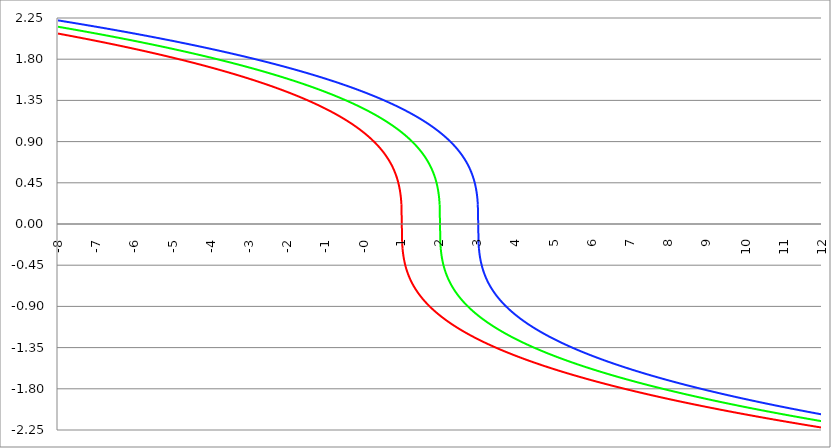
| Category | Series 1 | Series 0 | Series 2 |
|---|---|---|---|
| -8.0 | 2.08 | 2.154 | 2.224 |
| -7.99 | 2.079 | 2.154 | 2.223 |
| -7.98 | 2.079 | 2.153 | 2.223 |
| -7.97 | 2.078 | 2.152 | 2.222 |
| -7.960000000000001 | 2.077 | 2.152 | 2.221 |
| -7.950000000000001 | 2.076 | 2.151 | 2.221 |
| -7.940000000000001 | 2.075 | 2.15 | 2.22 |
| -7.930000000000001 | 2.075 | 2.149 | 2.219 |
| -7.920000000000002 | 2.074 | 2.149 | 2.219 |
| -7.910000000000002 | 2.073 | 2.148 | 2.218 |
| -7.900000000000002 | 2.072 | 2.147 | 2.217 |
| -7.890000000000002 | 2.072 | 2.147 | 2.217 |
| -7.880000000000002 | 2.071 | 2.146 | 2.216 |
| -7.870000000000003 | 2.07 | 2.145 | 2.215 |
| -7.860000000000003 | 2.069 | 2.144 | 2.215 |
| -7.850000000000003 | 2.068 | 2.144 | 2.214 |
| -7.840000000000003 | 2.068 | 2.143 | 2.213 |
| -7.830000000000004 | 2.067 | 2.142 | 2.212 |
| -7.820000000000004 | 2.066 | 2.141 | 2.212 |
| -7.810000000000004 | 2.065 | 2.141 | 2.211 |
| -7.800000000000004 | 2.065 | 2.14 | 2.21 |
| -7.790000000000004 | 2.064 | 2.139 | 2.21 |
| -7.780000000000004 | 2.063 | 2.139 | 2.209 |
| -7.770000000000004 | 2.062 | 2.138 | 2.208 |
| -7.760000000000005 | 2.061 | 2.137 | 2.208 |
| -7.750000000000005 | 2.061 | 2.136 | 2.207 |
| -7.740000000000005 | 2.06 | 2.136 | 2.206 |
| -7.730000000000005 | 2.059 | 2.135 | 2.206 |
| -7.720000000000006 | 2.058 | 2.134 | 2.205 |
| -7.710000000000006 | 2.057 | 2.133 | 2.204 |
| -7.700000000000006 | 2.057 | 2.133 | 2.204 |
| -7.690000000000006 | 2.056 | 2.132 | 2.203 |
| -7.680000000000007 | 2.055 | 2.131 | 2.202 |
| -7.670000000000007 | 2.054 | 2.13 | 2.202 |
| -7.660000000000007 | 2.054 | 2.13 | 2.201 |
| -7.650000000000007 | 2.053 | 2.129 | 2.2 |
| -7.640000000000008 | 2.052 | 2.128 | 2.199 |
| -7.630000000000008 | 2.051 | 2.128 | 2.199 |
| -7.620000000000008 | 2.05 | 2.127 | 2.198 |
| -7.610000000000008 | 2.05 | 2.126 | 2.197 |
| -7.600000000000008 | 2.049 | 2.125 | 2.197 |
| -7.590000000000009 | 2.048 | 2.125 | 2.196 |
| -7.580000000000009 | 2.047 | 2.124 | 2.195 |
| -7.57000000000001 | 2.046 | 2.123 | 2.195 |
| -7.560000000000009 | 2.046 | 2.122 | 2.194 |
| -7.55000000000001 | 2.045 | 2.122 | 2.193 |
| -7.54000000000001 | 2.044 | 2.121 | 2.193 |
| -7.53000000000001 | 2.043 | 2.12 | 2.192 |
| -7.52000000000001 | 2.042 | 2.119 | 2.191 |
| -7.51000000000001 | 2.042 | 2.119 | 2.19 |
| -7.500000000000011 | 2.041 | 2.118 | 2.19 |
| -7.490000000000011 | 2.04 | 2.117 | 2.189 |
| -7.480000000000011 | 2.039 | 2.116 | 2.188 |
| -7.470000000000011 | 2.038 | 2.116 | 2.188 |
| -7.460000000000011 | 2.038 | 2.115 | 2.187 |
| -7.450000000000012 | 2.037 | 2.114 | 2.186 |
| -7.440000000000012 | 2.036 | 2.113 | 2.186 |
| -7.430000000000012 | 2.035 | 2.113 | 2.185 |
| -7.420000000000012 | 2.034 | 2.112 | 2.184 |
| -7.410000000000013 | 2.034 | 2.111 | 2.183 |
| -7.400000000000013 | 2.033 | 2.11 | 2.183 |
| -7.390000000000013 | 2.032 | 2.11 | 2.182 |
| -7.380000000000013 | 2.031 | 2.109 | 2.181 |
| -7.370000000000013 | 2.03 | 2.108 | 2.181 |
| -7.360000000000014 | 2.03 | 2.107 | 2.18 |
| -7.350000000000014 | 2.029 | 2.107 | 2.179 |
| -7.340000000000014 | 2.028 | 2.106 | 2.179 |
| -7.330000000000014 | 2.027 | 2.105 | 2.178 |
| -7.320000000000014 | 2.026 | 2.104 | 2.177 |
| -7.310000000000015 | 2.026 | 2.104 | 2.176 |
| -7.300000000000015 | 2.025 | 2.103 | 2.176 |
| -7.290000000000015 | 2.024 | 2.102 | 2.175 |
| -7.280000000000015 | 2.023 | 2.101 | 2.174 |
| -7.270000000000015 | 2.022 | 2.101 | 2.174 |
| -7.260000000000016 | 2.021 | 2.1 | 2.173 |
| -7.250000000000016 | 2.021 | 2.099 | 2.172 |
| -7.240000000000016 | 2.02 | 2.098 | 2.172 |
| -7.230000000000016 | 2.019 | 2.098 | 2.171 |
| -7.220000000000017 | 2.018 | 2.097 | 2.17 |
| -7.210000000000017 | 2.017 | 2.096 | 2.169 |
| -7.200000000000017 | 2.017 | 2.095 | 2.169 |
| -7.190000000000017 | 2.016 | 2.095 | 2.168 |
| -7.180000000000017 | 2.015 | 2.094 | 2.167 |
| -7.170000000000018 | 2.014 | 2.093 | 2.167 |
| -7.160000000000018 | 2.013 | 2.092 | 2.166 |
| -7.150000000000018 | 2.012 | 2.092 | 2.165 |
| -7.140000000000018 | 2.012 | 2.091 | 2.164 |
| -7.130000000000019 | 2.011 | 2.09 | 2.164 |
| -7.120000000000019 | 2.01 | 2.089 | 2.163 |
| -7.110000000000019 | 2.009 | 2.089 | 2.162 |
| -7.100000000000019 | 2.008 | 2.088 | 2.162 |
| -7.090000000000019 | 2.007 | 2.087 | 2.161 |
| -7.08000000000002 | 2.007 | 2.086 | 2.16 |
| -7.07000000000002 | 2.006 | 2.085 | 2.159 |
| -7.06000000000002 | 2.005 | 2.085 | 2.159 |
| -7.05000000000002 | 2.004 | 2.084 | 2.158 |
| -7.04000000000002 | 2.003 | 2.083 | 2.157 |
| -7.03000000000002 | 2.002 | 2.082 | 2.157 |
| -7.020000000000021 | 2.002 | 2.082 | 2.156 |
| -7.010000000000021 | 2.001 | 2.081 | 2.155 |
| -7.000000000000021 | 2 | 2.08 | 2.154 |
| -6.990000000000021 | 1.999 | 2.079 | 2.154 |
| -6.980000000000021 | 1.998 | 2.079 | 2.153 |
| -6.970000000000021 | 1.997 | 2.078 | 2.152 |
| -6.960000000000022 | 1.997 | 2.077 | 2.152 |
| -6.950000000000022 | 1.996 | 2.076 | 2.151 |
| -6.940000000000022 | 1.995 | 2.075 | 2.15 |
| -6.930000000000022 | 1.994 | 2.075 | 2.149 |
| -6.920000000000023 | 1.993 | 2.074 | 2.149 |
| -6.910000000000023 | 1.992 | 2.073 | 2.148 |
| -6.900000000000023 | 1.992 | 2.072 | 2.147 |
| -6.890000000000024 | 1.991 | 2.072 | 2.147 |
| -6.880000000000024 | 1.99 | 2.071 | 2.146 |
| -6.870000000000024 | 1.989 | 2.07 | 2.145 |
| -6.860000000000024 | 1.988 | 2.069 | 2.144 |
| -6.850000000000024 | 1.987 | 2.068 | 2.144 |
| -6.840000000000024 | 1.987 | 2.068 | 2.143 |
| -6.830000000000024 | 1.986 | 2.067 | 2.142 |
| -6.820000000000025 | 1.985 | 2.066 | 2.141 |
| -6.810000000000025 | 1.984 | 2.065 | 2.141 |
| -6.800000000000025 | 1.983 | 2.065 | 2.14 |
| -6.790000000000025 | 1.982 | 2.064 | 2.139 |
| -6.780000000000025 | 1.981 | 2.063 | 2.139 |
| -6.770000000000026 | 1.981 | 2.062 | 2.138 |
| -6.760000000000026 | 1.98 | 2.061 | 2.137 |
| -6.750000000000026 | 1.979 | 2.061 | 2.136 |
| -6.740000000000026 | 1.978 | 2.06 | 2.136 |
| -6.730000000000026 | 1.977 | 2.059 | 2.135 |
| -6.720000000000027 | 1.976 | 2.058 | 2.134 |
| -6.710000000000027 | 1.976 | 2.057 | 2.133 |
| -6.700000000000027 | 1.975 | 2.057 | 2.133 |
| -6.690000000000028 | 1.974 | 2.056 | 2.132 |
| -6.680000000000028 | 1.973 | 2.055 | 2.131 |
| -6.670000000000028 | 1.972 | 2.054 | 2.13 |
| -6.660000000000028 | 1.971 | 2.054 | 2.13 |
| -6.650000000000029 | 1.97 | 2.053 | 2.129 |
| -6.640000000000029 | 1.97 | 2.052 | 2.128 |
| -6.63000000000003 | 1.969 | 2.051 | 2.128 |
| -6.620000000000029 | 1.968 | 2.05 | 2.127 |
| -6.61000000000003 | 1.967 | 2.05 | 2.126 |
| -6.60000000000003 | 1.966 | 2.049 | 2.125 |
| -6.59000000000003 | 1.965 | 2.048 | 2.125 |
| -6.58000000000003 | 1.964 | 2.047 | 2.124 |
| -6.57000000000003 | 1.964 | 2.046 | 2.123 |
| -6.560000000000031 | 1.963 | 2.046 | 2.122 |
| -6.550000000000031 | 1.962 | 2.045 | 2.122 |
| -6.540000000000031 | 1.961 | 2.044 | 2.121 |
| -6.530000000000031 | 1.96 | 2.043 | 2.12 |
| -6.520000000000032 | 1.959 | 2.042 | 2.119 |
| -6.510000000000032 | 1.958 | 2.042 | 2.119 |
| -6.500000000000032 | 1.957 | 2.041 | 2.118 |
| -6.490000000000032 | 1.957 | 2.04 | 2.117 |
| -6.480000000000032 | 1.956 | 2.039 | 2.116 |
| -6.470000000000032 | 1.955 | 2.038 | 2.116 |
| -6.460000000000033 | 1.954 | 2.038 | 2.115 |
| -6.450000000000033 | 1.953 | 2.037 | 2.114 |
| -6.440000000000033 | 1.952 | 2.036 | 2.113 |
| -6.430000000000033 | 1.951 | 2.035 | 2.113 |
| -6.420000000000034 | 1.95 | 2.034 | 2.112 |
| -6.410000000000034 | 1.95 | 2.034 | 2.111 |
| -6.400000000000034 | 1.949 | 2.033 | 2.11 |
| -6.390000000000034 | 1.948 | 2.032 | 2.11 |
| -6.380000000000034 | 1.947 | 2.031 | 2.109 |
| -6.370000000000034 | 1.946 | 2.03 | 2.108 |
| -6.360000000000035 | 1.945 | 2.03 | 2.107 |
| -6.350000000000035 | 1.944 | 2.029 | 2.107 |
| -6.340000000000035 | 1.943 | 2.028 | 2.106 |
| -6.330000000000035 | 1.943 | 2.027 | 2.105 |
| -6.320000000000036 | 1.942 | 2.026 | 2.104 |
| -6.310000000000036 | 1.941 | 2.026 | 2.104 |
| -6.300000000000036 | 1.94 | 2.025 | 2.103 |
| -6.290000000000036 | 1.939 | 2.024 | 2.102 |
| -6.280000000000036 | 1.938 | 2.023 | 2.101 |
| -6.270000000000036 | 1.937 | 2.022 | 2.101 |
| -6.260000000000037 | 1.936 | 2.021 | 2.1 |
| -6.250000000000037 | 1.935 | 2.021 | 2.099 |
| -6.240000000000037 | 1.935 | 2.02 | 2.098 |
| -6.230000000000037 | 1.934 | 2.019 | 2.098 |
| -6.220000000000038 | 1.933 | 2.018 | 2.097 |
| -6.210000000000038 | 1.932 | 2.017 | 2.096 |
| -6.200000000000038 | 1.931 | 2.017 | 2.095 |
| -6.190000000000039 | 1.93 | 2.016 | 2.095 |
| -6.180000000000039 | 1.929 | 2.015 | 2.094 |
| -6.170000000000039 | 1.928 | 2.014 | 2.093 |
| -6.160000000000039 | 1.927 | 2.013 | 2.092 |
| -6.150000000000039 | 1.926 | 2.012 | 2.092 |
| -6.14000000000004 | 1.926 | 2.012 | 2.091 |
| -6.13000000000004 | 1.925 | 2.011 | 2.09 |
| -6.12000000000004 | 1.924 | 2.01 | 2.089 |
| -6.11000000000004 | 1.923 | 2.009 | 2.089 |
| -6.10000000000004 | 1.922 | 2.008 | 2.088 |
| -6.090000000000041 | 1.921 | 2.007 | 2.087 |
| -6.080000000000041 | 1.92 | 2.007 | 2.086 |
| -6.070000000000041 | 1.919 | 2.006 | 2.085 |
| -6.060000000000041 | 1.918 | 2.005 | 2.085 |
| -6.050000000000042 | 1.917 | 2.004 | 2.084 |
| -6.040000000000042 | 1.917 | 2.003 | 2.083 |
| -6.030000000000042 | 1.916 | 2.002 | 2.082 |
| -6.020000000000042 | 1.915 | 2.002 | 2.082 |
| -6.010000000000042 | 1.914 | 2.001 | 2.081 |
| -6.000000000000043 | 1.913 | 2 | 2.08 |
| -5.990000000000043 | 1.912 | 1.999 | 2.079 |
| -5.980000000000043 | 1.911 | 1.998 | 2.079 |
| -5.970000000000043 | 1.91 | 1.997 | 2.078 |
| -5.960000000000043 | 1.909 | 1.997 | 2.077 |
| -5.950000000000044 | 1.908 | 1.996 | 2.076 |
| -5.940000000000044 | 1.907 | 1.995 | 2.075 |
| -5.930000000000044 | 1.907 | 1.994 | 2.075 |
| -5.920000000000044 | 1.906 | 1.993 | 2.074 |
| -5.910000000000044 | 1.905 | 1.992 | 2.073 |
| -5.900000000000044 | 1.904 | 1.992 | 2.072 |
| -5.890000000000045 | 1.903 | 1.991 | 2.072 |
| -5.880000000000045 | 1.902 | 1.99 | 2.071 |
| -5.870000000000045 | 1.901 | 1.989 | 2.07 |
| -5.860000000000046 | 1.9 | 1.988 | 2.069 |
| -5.850000000000046 | 1.899 | 1.987 | 2.068 |
| -5.840000000000046 | 1.898 | 1.987 | 2.068 |
| -5.830000000000046 | 1.897 | 1.986 | 2.067 |
| -5.820000000000046 | 1.896 | 1.985 | 2.066 |
| -5.810000000000047 | 1.895 | 1.984 | 2.065 |
| -5.800000000000047 | 1.895 | 1.983 | 2.065 |
| -5.790000000000047 | 1.894 | 1.982 | 2.064 |
| -5.780000000000047 | 1.893 | 1.981 | 2.063 |
| -5.770000000000047 | 1.892 | 1.981 | 2.062 |
| -5.760000000000048 | 1.891 | 1.98 | 2.061 |
| -5.750000000000048 | 1.89 | 1.979 | 2.061 |
| -5.740000000000048 | 1.889 | 1.978 | 2.06 |
| -5.730000000000048 | 1.888 | 1.977 | 2.059 |
| -5.720000000000049 | 1.887 | 1.976 | 2.058 |
| -5.710000000000049 | 1.886 | 1.976 | 2.057 |
| -5.700000000000049 | 1.885 | 1.975 | 2.057 |
| -5.690000000000049 | 1.884 | 1.974 | 2.056 |
| -5.680000000000049 | 1.883 | 1.973 | 2.055 |
| -5.67000000000005 | 1.882 | 1.972 | 2.054 |
| -5.66000000000005 | 1.881 | 1.971 | 2.054 |
| -5.65000000000005 | 1.881 | 1.97 | 2.053 |
| -5.64000000000005 | 1.88 | 1.97 | 2.052 |
| -5.63000000000005 | 1.879 | 1.969 | 2.051 |
| -5.620000000000051 | 1.878 | 1.968 | 2.05 |
| -5.610000000000051 | 1.877 | 1.967 | 2.05 |
| -5.600000000000051 | 1.876 | 1.966 | 2.049 |
| -5.590000000000051 | 1.875 | 1.965 | 2.048 |
| -5.580000000000052 | 1.874 | 1.964 | 2.047 |
| -5.570000000000052 | 1.873 | 1.964 | 2.046 |
| -5.560000000000052 | 1.872 | 1.963 | 2.046 |
| -5.550000000000052 | 1.871 | 1.962 | 2.045 |
| -5.540000000000052 | 1.87 | 1.961 | 2.044 |
| -5.530000000000053 | 1.869 | 1.96 | 2.043 |
| -5.520000000000053 | 1.868 | 1.959 | 2.042 |
| -5.510000000000053 | 1.867 | 1.958 | 2.042 |
| -5.500000000000053 | 1.866 | 1.957 | 2.041 |
| -5.490000000000053 | 1.865 | 1.957 | 2.04 |
| -5.480000000000054 | 1.864 | 1.956 | 2.039 |
| -5.470000000000054 | 1.863 | 1.955 | 2.038 |
| -5.460000000000054 | 1.862 | 1.954 | 2.038 |
| -5.450000000000054 | 1.861 | 1.953 | 2.037 |
| -5.440000000000054 | 1.86 | 1.952 | 2.036 |
| -5.430000000000054 | 1.86 | 1.951 | 2.035 |
| -5.420000000000055 | 1.859 | 1.95 | 2.034 |
| -5.410000000000055 | 1.858 | 1.95 | 2.034 |
| -5.400000000000055 | 1.857 | 1.949 | 2.033 |
| -5.390000000000056 | 1.856 | 1.948 | 2.032 |
| -5.380000000000056 | 1.855 | 1.947 | 2.031 |
| -5.370000000000056 | 1.854 | 1.946 | 2.03 |
| -5.360000000000056 | 1.853 | 1.945 | 2.03 |
| -5.350000000000056 | 1.852 | 1.944 | 2.029 |
| -5.340000000000057 | 1.851 | 1.943 | 2.028 |
| -5.330000000000057 | 1.85 | 1.943 | 2.027 |
| -5.320000000000057 | 1.849 | 1.942 | 2.026 |
| -5.310000000000057 | 1.848 | 1.941 | 2.026 |
| -5.300000000000058 | 1.847 | 1.94 | 2.025 |
| -5.290000000000058 | 1.846 | 1.939 | 2.024 |
| -5.280000000000058 | 1.845 | 1.938 | 2.023 |
| -5.270000000000058 | 1.844 | 1.937 | 2.022 |
| -5.260000000000058 | 1.843 | 1.936 | 2.021 |
| -5.250000000000059 | 1.842 | 1.935 | 2.021 |
| -5.240000000000059 | 1.841 | 1.935 | 2.02 |
| -5.23000000000006 | 1.84 | 1.934 | 2.019 |
| -5.220000000000059 | 1.839 | 1.933 | 2.018 |
| -5.210000000000059 | 1.838 | 1.932 | 2.017 |
| -5.20000000000006 | 1.837 | 1.931 | 2.017 |
| -5.19000000000006 | 1.836 | 1.93 | 2.016 |
| -5.18000000000006 | 1.835 | 1.929 | 2.015 |
| -5.17000000000006 | 1.834 | 1.928 | 2.014 |
| -5.160000000000061 | 1.833 | 1.927 | 2.013 |
| -5.150000000000061 | 1.832 | 1.926 | 2.012 |
| -5.140000000000061 | 1.831 | 1.926 | 2.012 |
| -5.130000000000061 | 1.83 | 1.925 | 2.011 |
| -5.120000000000061 | 1.829 | 1.924 | 2.01 |
| -5.110000000000062 | 1.828 | 1.923 | 2.009 |
| -5.100000000000062 | 1.827 | 1.922 | 2.008 |
| -5.090000000000062 | 1.826 | 1.921 | 2.007 |
| -5.080000000000062 | 1.825 | 1.92 | 2.007 |
| -5.070000000000062 | 1.824 | 1.919 | 2.006 |
| -5.060000000000063 | 1.823 | 1.918 | 2.005 |
| -5.050000000000063 | 1.822 | 1.917 | 2.004 |
| -5.040000000000063 | 1.821 | 1.917 | 2.003 |
| -5.030000000000063 | 1.82 | 1.916 | 2.002 |
| -5.020000000000064 | 1.819 | 1.915 | 2.002 |
| -5.010000000000064 | 1.818 | 1.914 | 2.001 |
| -5.000000000000064 | 1.817 | 1.913 | 2 |
| -4.990000000000064 | 1.816 | 1.912 | 1.999 |
| -4.980000000000064 | 1.815 | 1.911 | 1.998 |
| -4.970000000000064 | 1.814 | 1.91 | 1.997 |
| -4.960000000000064 | 1.813 | 1.909 | 1.997 |
| -4.950000000000064 | 1.812 | 1.908 | 1.996 |
| -4.940000000000065 | 1.811 | 1.907 | 1.995 |
| -4.930000000000065 | 1.81 | 1.907 | 1.994 |
| -4.920000000000065 | 1.809 | 1.906 | 1.993 |
| -4.910000000000065 | 1.808 | 1.905 | 1.992 |
| -4.900000000000066 | 1.807 | 1.904 | 1.992 |
| -4.890000000000066 | 1.806 | 1.903 | 1.991 |
| -4.880000000000066 | 1.805 | 1.902 | 1.99 |
| -4.870000000000066 | 1.804 | 1.901 | 1.989 |
| -4.860000000000067 | 1.803 | 1.9 | 1.988 |
| -4.850000000000067 | 1.802 | 1.899 | 1.987 |
| -4.840000000000067 | 1.801 | 1.898 | 1.987 |
| -4.830000000000067 | 1.8 | 1.897 | 1.986 |
| -4.820000000000068 | 1.799 | 1.896 | 1.985 |
| -4.810000000000068 | 1.798 | 1.895 | 1.984 |
| -4.800000000000068 | 1.797 | 1.895 | 1.983 |
| -4.790000000000068 | 1.796 | 1.894 | 1.982 |
| -4.780000000000068 | 1.795 | 1.893 | 1.981 |
| -4.770000000000068 | 1.794 | 1.892 | 1.981 |
| -4.760000000000069 | 1.793 | 1.891 | 1.98 |
| -4.75000000000007 | 1.792 | 1.89 | 1.979 |
| -4.74000000000007 | 1.79 | 1.889 | 1.978 |
| -4.73000000000007 | 1.789 | 1.888 | 1.977 |
| -4.72000000000007 | 1.788 | 1.887 | 1.976 |
| -4.71000000000007 | 1.787 | 1.886 | 1.976 |
| -4.70000000000007 | 1.786 | 1.885 | 1.975 |
| -4.69000000000007 | 1.785 | 1.884 | 1.974 |
| -4.680000000000071 | 1.784 | 1.883 | 1.973 |
| -4.670000000000071 | 1.783 | 1.882 | 1.972 |
| -4.660000000000071 | 1.782 | 1.881 | 1.971 |
| -4.650000000000071 | 1.781 | 1.881 | 1.97 |
| -4.640000000000072 | 1.78 | 1.88 | 1.97 |
| -4.630000000000072 | 1.779 | 1.879 | 1.969 |
| -4.620000000000072 | 1.778 | 1.878 | 1.968 |
| -4.610000000000072 | 1.777 | 1.877 | 1.967 |
| -4.600000000000072 | 1.776 | 1.876 | 1.966 |
| -4.590000000000073 | 1.775 | 1.875 | 1.965 |
| -4.580000000000073 | 1.774 | 1.874 | 1.964 |
| -4.570000000000073 | 1.773 | 1.873 | 1.964 |
| -4.560000000000073 | 1.772 | 1.872 | 1.963 |
| -4.550000000000074 | 1.771 | 1.871 | 1.962 |
| -4.540000000000074 | 1.769 | 1.87 | 1.961 |
| -4.530000000000074 | 1.768 | 1.869 | 1.96 |
| -4.520000000000074 | 1.767 | 1.868 | 1.959 |
| -4.510000000000074 | 1.766 | 1.867 | 1.958 |
| -4.500000000000074 | 1.765 | 1.866 | 1.957 |
| -4.490000000000074 | 1.764 | 1.865 | 1.957 |
| -4.480000000000074 | 1.763 | 1.864 | 1.956 |
| -4.470000000000075 | 1.762 | 1.863 | 1.955 |
| -4.460000000000075 | 1.761 | 1.862 | 1.954 |
| -4.450000000000075 | 1.76 | 1.861 | 1.953 |
| -4.440000000000075 | 1.759 | 1.86 | 1.952 |
| -4.430000000000076 | 1.758 | 1.86 | 1.951 |
| -4.420000000000076 | 1.757 | 1.859 | 1.95 |
| -4.410000000000076 | 1.755 | 1.858 | 1.95 |
| -4.400000000000076 | 1.754 | 1.857 | 1.949 |
| -4.390000000000077 | 1.753 | 1.856 | 1.948 |
| -4.380000000000077 | 1.752 | 1.855 | 1.947 |
| -4.370000000000077 | 1.751 | 1.854 | 1.946 |
| -4.360000000000078 | 1.75 | 1.853 | 1.945 |
| -4.350000000000078 | 1.749 | 1.852 | 1.944 |
| -4.340000000000078 | 1.748 | 1.851 | 1.943 |
| -4.330000000000078 | 1.747 | 1.85 | 1.943 |
| -4.320000000000078 | 1.746 | 1.849 | 1.942 |
| -4.310000000000079 | 1.745 | 1.848 | 1.941 |
| -4.300000000000079 | 1.744 | 1.847 | 1.94 |
| -4.29000000000008 | 1.742 | 1.846 | 1.939 |
| -4.28000000000008 | 1.741 | 1.845 | 1.938 |
| -4.27000000000008 | 1.74 | 1.844 | 1.937 |
| -4.26000000000008 | 1.739 | 1.843 | 1.936 |
| -4.25000000000008 | 1.738 | 1.842 | 1.935 |
| -4.24000000000008 | 1.737 | 1.841 | 1.935 |
| -4.23000000000008 | 1.736 | 1.84 | 1.934 |
| -4.220000000000081 | 1.735 | 1.839 | 1.933 |
| -4.210000000000081 | 1.734 | 1.838 | 1.932 |
| -4.200000000000081 | 1.732 | 1.837 | 1.931 |
| -4.190000000000081 | 1.731 | 1.836 | 1.93 |
| -4.180000000000081 | 1.73 | 1.835 | 1.929 |
| -4.170000000000082 | 1.729 | 1.834 | 1.928 |
| -4.160000000000082 | 1.728 | 1.833 | 1.927 |
| -4.150000000000082 | 1.727 | 1.832 | 1.926 |
| -4.140000000000082 | 1.726 | 1.831 | 1.926 |
| -4.130000000000082 | 1.725 | 1.83 | 1.925 |
| -4.120000000000083 | 1.724 | 1.829 | 1.924 |
| -4.110000000000083 | 1.722 | 1.828 | 1.923 |
| -4.100000000000083 | 1.721 | 1.827 | 1.922 |
| -4.090000000000083 | 1.72 | 1.826 | 1.921 |
| -4.080000000000084 | 1.719 | 1.825 | 1.92 |
| -4.070000000000084 | 1.718 | 1.824 | 1.919 |
| -4.060000000000084 | 1.717 | 1.823 | 1.918 |
| -4.050000000000084 | 1.716 | 1.822 | 1.917 |
| -4.040000000000084 | 1.715 | 1.821 | 1.917 |
| -4.030000000000084 | 1.713 | 1.82 | 1.916 |
| -4.020000000000085 | 1.712 | 1.819 | 1.915 |
| -4.010000000000085 | 1.711 | 1.818 | 1.914 |
| -4.000000000000085 | 1.71 | 1.817 | 1.913 |
| -3.990000000000085 | 1.709 | 1.816 | 1.912 |
| -3.980000000000086 | 1.708 | 1.815 | 1.911 |
| -3.970000000000086 | 1.707 | 1.814 | 1.91 |
| -3.960000000000086 | 1.705 | 1.813 | 1.909 |
| -3.950000000000086 | 1.704 | 1.812 | 1.908 |
| -3.940000000000087 | 1.703 | 1.811 | 1.907 |
| -3.930000000000087 | 1.702 | 1.81 | 1.907 |
| -3.920000000000087 | 1.701 | 1.809 | 1.906 |
| -3.910000000000087 | 1.7 | 1.808 | 1.905 |
| -3.900000000000087 | 1.698 | 1.807 | 1.904 |
| -3.890000000000088 | 1.697 | 1.806 | 1.903 |
| -3.880000000000088 | 1.696 | 1.805 | 1.902 |
| -3.870000000000088 | 1.695 | 1.804 | 1.901 |
| -3.860000000000088 | 1.694 | 1.803 | 1.9 |
| -3.850000000000088 | 1.693 | 1.802 | 1.899 |
| -3.840000000000089 | 1.692 | 1.801 | 1.898 |
| -3.830000000000089 | 1.69 | 1.8 | 1.897 |
| -3.820000000000089 | 1.689 | 1.799 | 1.896 |
| -3.810000000000089 | 1.688 | 1.798 | 1.895 |
| -3.800000000000089 | 1.687 | 1.797 | 1.895 |
| -3.79000000000009 | 1.686 | 1.796 | 1.894 |
| -3.78000000000009 | 1.685 | 1.795 | 1.893 |
| -3.77000000000009 | 1.683 | 1.794 | 1.892 |
| -3.76000000000009 | 1.682 | 1.793 | 1.891 |
| -3.750000000000091 | 1.681 | 1.792 | 1.89 |
| -3.740000000000091 | 1.68 | 1.79 | 1.889 |
| -3.730000000000091 | 1.679 | 1.789 | 1.888 |
| -3.720000000000091 | 1.677 | 1.788 | 1.887 |
| -3.710000000000091 | 1.676 | 1.787 | 1.886 |
| -3.700000000000092 | 1.675 | 1.786 | 1.885 |
| -3.690000000000092 | 1.674 | 1.785 | 1.884 |
| -3.680000000000092 | 1.673 | 1.784 | 1.883 |
| -3.670000000000092 | 1.671 | 1.783 | 1.882 |
| -3.660000000000092 | 1.67 | 1.782 | 1.881 |
| -3.650000000000093 | 1.669 | 1.781 | 1.881 |
| -3.640000000000093 | 1.668 | 1.78 | 1.88 |
| -3.630000000000093 | 1.667 | 1.779 | 1.879 |
| -3.620000000000093 | 1.666 | 1.778 | 1.878 |
| -3.610000000000093 | 1.664 | 1.777 | 1.877 |
| -3.600000000000094 | 1.663 | 1.776 | 1.876 |
| -3.590000000000094 | 1.662 | 1.775 | 1.875 |
| -3.580000000000094 | 1.661 | 1.774 | 1.874 |
| -3.570000000000094 | 1.659 | 1.773 | 1.873 |
| -3.560000000000095 | 1.658 | 1.772 | 1.872 |
| -3.550000000000095 | 1.657 | 1.771 | 1.871 |
| -3.540000000000095 | 1.656 | 1.769 | 1.87 |
| -3.530000000000095 | 1.655 | 1.768 | 1.869 |
| -3.520000000000095 | 1.653 | 1.767 | 1.868 |
| -3.510000000000096 | 1.652 | 1.766 | 1.867 |
| -3.500000000000096 | 1.651 | 1.765 | 1.866 |
| -3.490000000000096 | 1.65 | 1.764 | 1.865 |
| -3.480000000000096 | 1.649 | 1.763 | 1.864 |
| -3.470000000000097 | 1.647 | 1.762 | 1.863 |
| -3.460000000000097 | 1.646 | 1.761 | 1.862 |
| -3.450000000000097 | 1.645 | 1.76 | 1.861 |
| -3.440000000000097 | 1.644 | 1.759 | 1.86 |
| -3.430000000000097 | 1.642 | 1.758 | 1.86 |
| -3.420000000000098 | 1.641 | 1.757 | 1.859 |
| -3.410000000000098 | 1.64 | 1.755 | 1.858 |
| -3.400000000000098 | 1.639 | 1.754 | 1.857 |
| -3.390000000000098 | 1.637 | 1.753 | 1.856 |
| -3.380000000000098 | 1.636 | 1.752 | 1.855 |
| -3.370000000000099 | 1.635 | 1.751 | 1.854 |
| -3.360000000000099 | 1.634 | 1.75 | 1.853 |
| -3.350000000000099 | 1.632 | 1.749 | 1.852 |
| -3.340000000000099 | 1.631 | 1.748 | 1.851 |
| -3.330000000000099 | 1.63 | 1.747 | 1.85 |
| -3.3200000000001 | 1.629 | 1.746 | 1.849 |
| -3.3100000000001 | 1.627 | 1.745 | 1.848 |
| -3.3000000000001 | 1.626 | 1.744 | 1.847 |
| -3.2900000000001 | 1.625 | 1.742 | 1.846 |
| -3.280000000000101 | 1.624 | 1.741 | 1.845 |
| -3.270000000000101 | 1.622 | 1.74 | 1.844 |
| -3.260000000000101 | 1.621 | 1.739 | 1.843 |
| -3.250000000000101 | 1.62 | 1.738 | 1.842 |
| -3.240000000000101 | 1.619 | 1.737 | 1.841 |
| -3.230000000000102 | 1.617 | 1.736 | 1.84 |
| -3.220000000000102 | 1.616 | 1.735 | 1.839 |
| -3.210000000000102 | 1.615 | 1.734 | 1.838 |
| -3.200000000000102 | 1.613 | 1.732 | 1.837 |
| -3.190000000000103 | 1.612 | 1.731 | 1.836 |
| -3.180000000000103 | 1.611 | 1.73 | 1.835 |
| -3.170000000000103 | 1.61 | 1.729 | 1.834 |
| -3.160000000000103 | 1.608 | 1.728 | 1.833 |
| -3.150000000000103 | 1.607 | 1.727 | 1.832 |
| -3.140000000000104 | 1.606 | 1.726 | 1.831 |
| -3.130000000000104 | 1.604 | 1.725 | 1.83 |
| -3.120000000000104 | 1.603 | 1.724 | 1.829 |
| -3.110000000000104 | 1.602 | 1.722 | 1.828 |
| -3.100000000000104 | 1.601 | 1.721 | 1.827 |
| -3.090000000000105 | 1.599 | 1.72 | 1.826 |
| -3.080000000000105 | 1.598 | 1.719 | 1.825 |
| -3.070000000000105 | 1.597 | 1.718 | 1.824 |
| -3.060000000000105 | 1.595 | 1.717 | 1.823 |
| -3.050000000000106 | 1.594 | 1.716 | 1.822 |
| -3.040000000000106 | 1.593 | 1.715 | 1.821 |
| -3.030000000000106 | 1.591 | 1.713 | 1.82 |
| -3.020000000000106 | 1.59 | 1.712 | 1.819 |
| -3.010000000000106 | 1.589 | 1.711 | 1.818 |
| -3.000000000000107 | 1.587 | 1.71 | 1.817 |
| -2.990000000000107 | 1.586 | 1.709 | 1.816 |
| -2.980000000000107 | 1.585 | 1.708 | 1.815 |
| -2.970000000000107 | 1.583 | 1.707 | 1.814 |
| -2.960000000000107 | 1.582 | 1.705 | 1.813 |
| -2.950000000000108 | 1.581 | 1.704 | 1.812 |
| -2.940000000000108 | 1.579 | 1.703 | 1.811 |
| -2.930000000000108 | 1.578 | 1.702 | 1.81 |
| -2.920000000000108 | 1.577 | 1.701 | 1.809 |
| -2.910000000000108 | 1.575 | 1.7 | 1.808 |
| -2.900000000000109 | 1.574 | 1.698 | 1.807 |
| -2.890000000000109 | 1.573 | 1.697 | 1.806 |
| -2.880000000000109 | 1.571 | 1.696 | 1.805 |
| -2.870000000000109 | 1.57 | 1.695 | 1.804 |
| -2.86000000000011 | 1.569 | 1.694 | 1.803 |
| -2.85000000000011 | 1.567 | 1.693 | 1.802 |
| -2.84000000000011 | 1.566 | 1.692 | 1.801 |
| -2.83000000000011 | 1.565 | 1.69 | 1.8 |
| -2.82000000000011 | 1.563 | 1.689 | 1.799 |
| -2.810000000000111 | 1.562 | 1.688 | 1.798 |
| -2.800000000000111 | 1.56 | 1.687 | 1.797 |
| -2.790000000000111 | 1.559 | 1.686 | 1.796 |
| -2.780000000000111 | 1.558 | 1.685 | 1.795 |
| -2.770000000000111 | 1.556 | 1.683 | 1.794 |
| -2.760000000000112 | 1.555 | 1.682 | 1.793 |
| -2.750000000000112 | 1.554 | 1.681 | 1.792 |
| -2.740000000000112 | 1.552 | 1.68 | 1.79 |
| -2.730000000000112 | 1.551 | 1.679 | 1.789 |
| -2.720000000000112 | 1.549 | 1.677 | 1.788 |
| -2.710000000000113 | 1.548 | 1.676 | 1.787 |
| -2.700000000000113 | 1.547 | 1.675 | 1.786 |
| -2.690000000000113 | 1.545 | 1.674 | 1.785 |
| -2.680000000000113 | 1.544 | 1.673 | 1.784 |
| -2.670000000000114 | 1.542 | 1.671 | 1.783 |
| -2.660000000000114 | 1.541 | 1.67 | 1.782 |
| -2.650000000000114 | 1.54 | 1.669 | 1.781 |
| -2.640000000000114 | 1.538 | 1.668 | 1.78 |
| -2.630000000000114 | 1.537 | 1.667 | 1.779 |
| -2.620000000000115 | 1.535 | 1.666 | 1.778 |
| -2.610000000000115 | 1.534 | 1.664 | 1.777 |
| -2.600000000000115 | 1.533 | 1.663 | 1.776 |
| -2.590000000000115 | 1.531 | 1.662 | 1.775 |
| -2.580000000000116 | 1.53 | 1.661 | 1.774 |
| -2.570000000000116 | 1.528 | 1.659 | 1.773 |
| -2.560000000000116 | 1.527 | 1.658 | 1.772 |
| -2.550000000000116 | 1.525 | 1.657 | 1.771 |
| -2.540000000000116 | 1.524 | 1.656 | 1.769 |
| -2.530000000000117 | 1.523 | 1.655 | 1.768 |
| -2.520000000000117 | 1.521 | 1.653 | 1.767 |
| -2.510000000000117 | 1.52 | 1.652 | 1.766 |
| -2.500000000000117 | 1.518 | 1.651 | 1.765 |
| -2.490000000000117 | 1.517 | 1.65 | 1.764 |
| -2.480000000000118 | 1.515 | 1.649 | 1.763 |
| -2.470000000000118 | 1.514 | 1.647 | 1.762 |
| -2.460000000000118 | 1.512 | 1.646 | 1.761 |
| -2.450000000000118 | 1.511 | 1.645 | 1.76 |
| -2.440000000000118 | 1.51 | 1.644 | 1.759 |
| -2.430000000000119 | 1.508 | 1.642 | 1.758 |
| -2.420000000000119 | 1.507 | 1.641 | 1.757 |
| -2.410000000000119 | 1.505 | 1.64 | 1.755 |
| -2.400000000000119 | 1.504 | 1.639 | 1.754 |
| -2.39000000000012 | 1.502 | 1.637 | 1.753 |
| -2.38000000000012 | 1.501 | 1.636 | 1.752 |
| -2.37000000000012 | 1.499 | 1.635 | 1.751 |
| -2.36000000000012 | 1.498 | 1.634 | 1.75 |
| -2.35000000000012 | 1.496 | 1.632 | 1.749 |
| -2.340000000000121 | 1.495 | 1.631 | 1.748 |
| -2.330000000000121 | 1.493 | 1.63 | 1.747 |
| -2.320000000000121 | 1.492 | 1.629 | 1.746 |
| -2.310000000000121 | 1.49 | 1.627 | 1.745 |
| -2.300000000000121 | 1.489 | 1.626 | 1.744 |
| -2.290000000000122 | 1.487 | 1.625 | 1.742 |
| -2.280000000000122 | 1.486 | 1.624 | 1.741 |
| -2.270000000000122 | 1.484 | 1.622 | 1.74 |
| -2.260000000000122 | 1.483 | 1.621 | 1.739 |
| -2.250000000000123 | 1.481 | 1.62 | 1.738 |
| -2.240000000000123 | 1.48 | 1.619 | 1.737 |
| -2.230000000000123 | 1.478 | 1.617 | 1.736 |
| -2.220000000000123 | 1.477 | 1.616 | 1.735 |
| -2.210000000000123 | 1.475 | 1.615 | 1.734 |
| -2.200000000000124 | 1.474 | 1.613 | 1.732 |
| -2.190000000000124 | 1.472 | 1.612 | 1.731 |
| -2.180000000000124 | 1.471 | 1.611 | 1.73 |
| -2.170000000000124 | 1.469 | 1.61 | 1.729 |
| -2.160000000000124 | 1.467 | 1.608 | 1.728 |
| -2.150000000000125 | 1.466 | 1.607 | 1.727 |
| -2.140000000000125 | 1.464 | 1.606 | 1.726 |
| -2.130000000000125 | 1.463 | 1.604 | 1.725 |
| -2.120000000000125 | 1.461 | 1.603 | 1.724 |
| -2.110000000000126 | 1.46 | 1.602 | 1.722 |
| -2.100000000000126 | 1.458 | 1.601 | 1.721 |
| -2.090000000000126 | 1.457 | 1.599 | 1.72 |
| -2.080000000000126 | 1.455 | 1.598 | 1.719 |
| -2.070000000000126 | 1.453 | 1.597 | 1.718 |
| -2.060000000000127 | 1.452 | 1.595 | 1.717 |
| -2.050000000000127 | 1.45 | 1.594 | 1.716 |
| -2.040000000000127 | 1.449 | 1.593 | 1.715 |
| -2.030000000000127 | 1.447 | 1.591 | 1.713 |
| -2.020000000000127 | 1.445 | 1.59 | 1.712 |
| -2.010000000000128 | 1.444 | 1.589 | 1.711 |
| -2.000000000000128 | 1.442 | 1.587 | 1.71 |
| -1.990000000000128 | 1.441 | 1.586 | 1.709 |
| -1.980000000000128 | 1.439 | 1.585 | 1.708 |
| -1.970000000000128 | 1.437 | 1.583 | 1.707 |
| -1.960000000000128 | 1.436 | 1.582 | 1.705 |
| -1.950000000000128 | 1.434 | 1.581 | 1.704 |
| -1.940000000000128 | 1.433 | 1.579 | 1.703 |
| -1.930000000000128 | 1.431 | 1.578 | 1.702 |
| -1.920000000000128 | 1.429 | 1.577 | 1.701 |
| -1.910000000000128 | 1.428 | 1.575 | 1.7 |
| -1.900000000000128 | 1.426 | 1.574 | 1.698 |
| -1.890000000000128 | 1.424 | 1.573 | 1.697 |
| -1.880000000000128 | 1.423 | 1.571 | 1.696 |
| -1.870000000000128 | 1.421 | 1.57 | 1.695 |
| -1.860000000000128 | 1.419 | 1.569 | 1.694 |
| -1.850000000000128 | 1.418 | 1.567 | 1.693 |
| -1.840000000000128 | 1.416 | 1.566 | 1.692 |
| -1.830000000000128 | 1.414 | 1.565 | 1.69 |
| -1.820000000000128 | 1.413 | 1.563 | 1.689 |
| -1.810000000000128 | 1.411 | 1.562 | 1.688 |
| -1.800000000000128 | 1.409 | 1.56 | 1.687 |
| -1.790000000000128 | 1.408 | 1.559 | 1.686 |
| -1.780000000000128 | 1.406 | 1.558 | 1.685 |
| -1.770000000000128 | 1.404 | 1.556 | 1.683 |
| -1.760000000000128 | 1.403 | 1.555 | 1.682 |
| -1.750000000000128 | 1.401 | 1.554 | 1.681 |
| -1.740000000000128 | 1.399 | 1.552 | 1.68 |
| -1.730000000000128 | 1.398 | 1.551 | 1.679 |
| -1.720000000000128 | 1.396 | 1.549 | 1.677 |
| -1.710000000000128 | 1.394 | 1.548 | 1.676 |
| -1.700000000000128 | 1.392 | 1.547 | 1.675 |
| -1.690000000000128 | 1.391 | 1.545 | 1.674 |
| -1.680000000000128 | 1.389 | 1.544 | 1.673 |
| -1.670000000000128 | 1.387 | 1.542 | 1.671 |
| -1.660000000000127 | 1.386 | 1.541 | 1.67 |
| -1.650000000000127 | 1.384 | 1.54 | 1.669 |
| -1.640000000000127 | 1.382 | 1.538 | 1.668 |
| -1.630000000000127 | 1.38 | 1.537 | 1.667 |
| -1.620000000000127 | 1.379 | 1.535 | 1.666 |
| -1.610000000000127 | 1.377 | 1.534 | 1.664 |
| -1.600000000000127 | 1.375 | 1.533 | 1.663 |
| -1.590000000000128 | 1.373 | 1.531 | 1.662 |
| -1.580000000000128 | 1.372 | 1.53 | 1.661 |
| -1.570000000000128 | 1.37 | 1.528 | 1.659 |
| -1.560000000000127 | 1.368 | 1.527 | 1.658 |
| -1.550000000000127 | 1.366 | 1.525 | 1.657 |
| -1.540000000000127 | 1.364 | 1.524 | 1.656 |
| -1.530000000000127 | 1.363 | 1.523 | 1.655 |
| -1.520000000000127 | 1.361 | 1.521 | 1.653 |
| -1.510000000000127 | 1.359 | 1.52 | 1.652 |
| -1.500000000000127 | 1.357 | 1.518 | 1.651 |
| -1.490000000000127 | 1.355 | 1.517 | 1.65 |
| -1.480000000000127 | 1.354 | 1.515 | 1.649 |
| -1.470000000000127 | 1.352 | 1.514 | 1.647 |
| -1.460000000000127 | 1.35 | 1.512 | 1.646 |
| -1.450000000000127 | 1.348 | 1.511 | 1.645 |
| -1.440000000000127 | 1.346 | 1.51 | 1.644 |
| -1.430000000000127 | 1.344 | 1.508 | 1.642 |
| -1.420000000000127 | 1.343 | 1.507 | 1.641 |
| -1.410000000000127 | 1.341 | 1.505 | 1.64 |
| -1.400000000000127 | 1.339 | 1.504 | 1.639 |
| -1.390000000000127 | 1.337 | 1.502 | 1.637 |
| -1.380000000000127 | 1.335 | 1.501 | 1.636 |
| -1.370000000000127 | 1.333 | 1.499 | 1.635 |
| -1.360000000000127 | 1.331 | 1.498 | 1.634 |
| -1.350000000000127 | 1.33 | 1.496 | 1.632 |
| -1.340000000000127 | 1.328 | 1.495 | 1.631 |
| -1.330000000000127 | 1.326 | 1.493 | 1.63 |
| -1.320000000000127 | 1.324 | 1.492 | 1.629 |
| -1.310000000000127 | 1.322 | 1.49 | 1.627 |
| -1.300000000000127 | 1.32 | 1.489 | 1.626 |
| -1.290000000000127 | 1.318 | 1.487 | 1.625 |
| -1.280000000000127 | 1.316 | 1.486 | 1.624 |
| -1.270000000000127 | 1.314 | 1.484 | 1.622 |
| -1.260000000000127 | 1.312 | 1.483 | 1.621 |
| -1.250000000000127 | 1.31 | 1.481 | 1.62 |
| -1.240000000000127 | 1.308 | 1.48 | 1.619 |
| -1.230000000000127 | 1.306 | 1.478 | 1.617 |
| -1.220000000000127 | 1.305 | 1.477 | 1.616 |
| -1.210000000000127 | 1.303 | 1.475 | 1.615 |
| -1.200000000000127 | 1.301 | 1.474 | 1.613 |
| -1.190000000000127 | 1.299 | 1.472 | 1.612 |
| -1.180000000000127 | 1.297 | 1.471 | 1.611 |
| -1.170000000000127 | 1.295 | 1.469 | 1.61 |
| -1.160000000000127 | 1.293 | 1.467 | 1.608 |
| -1.150000000000127 | 1.291 | 1.466 | 1.607 |
| -1.140000000000127 | 1.289 | 1.464 | 1.606 |
| -1.130000000000127 | 1.287 | 1.463 | 1.604 |
| -1.120000000000127 | 1.285 | 1.461 | 1.603 |
| -1.110000000000127 | 1.283 | 1.46 | 1.602 |
| -1.100000000000127 | 1.281 | 1.458 | 1.601 |
| -1.090000000000127 | 1.279 | 1.457 | 1.599 |
| -1.080000000000127 | 1.277 | 1.455 | 1.598 |
| -1.070000000000127 | 1.274 | 1.453 | 1.597 |
| -1.060000000000127 | 1.272 | 1.452 | 1.595 |
| -1.050000000000127 | 1.27 | 1.45 | 1.594 |
| -1.040000000000127 | 1.268 | 1.449 | 1.593 |
| -1.030000000000127 | 1.266 | 1.447 | 1.591 |
| -1.020000000000127 | 1.264 | 1.445 | 1.59 |
| -1.010000000000127 | 1.262 | 1.444 | 1.589 |
| -1.000000000000127 | 1.26 | 1.442 | 1.587 |
| -0.990000000000127 | 1.258 | 1.441 | 1.586 |
| -0.980000000000127 | 1.256 | 1.439 | 1.585 |
| -0.970000000000127 | 1.254 | 1.437 | 1.583 |
| -0.960000000000127 | 1.251 | 1.436 | 1.582 |
| -0.950000000000127 | 1.249 | 1.434 | 1.581 |
| -0.940000000000127 | 1.247 | 1.433 | 1.579 |
| -0.930000000000127 | 1.245 | 1.431 | 1.578 |
| -0.920000000000127 | 1.243 | 1.429 | 1.577 |
| -0.910000000000127 | 1.241 | 1.428 | 1.575 |
| -0.900000000000127 | 1.239 | 1.426 | 1.574 |
| -0.890000000000127 | 1.236 | 1.424 | 1.573 |
| -0.880000000000127 | 1.234 | 1.423 | 1.571 |
| -0.870000000000127 | 1.232 | 1.421 | 1.57 |
| -0.860000000000127 | 1.23 | 1.419 | 1.569 |
| -0.850000000000127 | 1.228 | 1.418 | 1.567 |
| -0.840000000000127 | 1.225 | 1.416 | 1.566 |
| -0.830000000000127 | 1.223 | 1.414 | 1.565 |
| -0.820000000000127 | 1.221 | 1.413 | 1.563 |
| -0.810000000000127 | 1.219 | 1.411 | 1.562 |
| -0.800000000000127 | 1.216 | 1.409 | 1.56 |
| -0.790000000000127 | 1.214 | 1.408 | 1.559 |
| -0.780000000000127 | 1.212 | 1.406 | 1.558 |
| -0.770000000000127 | 1.21 | 1.404 | 1.556 |
| -0.760000000000127 | 1.207 | 1.403 | 1.555 |
| -0.750000000000127 | 1.205 | 1.401 | 1.554 |
| -0.740000000000127 | 1.203 | 1.399 | 1.552 |
| -0.730000000000127 | 1.2 | 1.398 | 1.551 |
| -0.720000000000127 | 1.198 | 1.396 | 1.549 |
| -0.710000000000127 | 1.196 | 1.394 | 1.548 |
| -0.700000000000127 | 1.193 | 1.392 | 1.547 |
| -0.690000000000127 | 1.191 | 1.391 | 1.545 |
| -0.680000000000127 | 1.189 | 1.389 | 1.544 |
| -0.670000000000127 | 1.186 | 1.387 | 1.542 |
| -0.660000000000127 | 1.184 | 1.386 | 1.541 |
| -0.650000000000127 | 1.182 | 1.384 | 1.54 |
| -0.640000000000127 | 1.179 | 1.382 | 1.538 |
| -0.630000000000127 | 1.177 | 1.38 | 1.537 |
| -0.620000000000127 | 1.174 | 1.379 | 1.535 |
| -0.610000000000127 | 1.172 | 1.377 | 1.534 |
| -0.600000000000127 | 1.17 | 1.375 | 1.533 |
| -0.590000000000127 | 1.167 | 1.373 | 1.531 |
| -0.580000000000127 | 1.165 | 1.372 | 1.53 |
| -0.570000000000127 | 1.162 | 1.37 | 1.528 |
| -0.560000000000127 | 1.16 | 1.368 | 1.527 |
| -0.550000000000127 | 1.157 | 1.366 | 1.525 |
| -0.540000000000127 | 1.155 | 1.364 | 1.524 |
| -0.530000000000127 | 1.152 | 1.363 | 1.523 |
| -0.520000000000127 | 1.15 | 1.361 | 1.521 |
| -0.510000000000127 | 1.147 | 1.359 | 1.52 |
| -0.500000000000127 | 1.145 | 1.357 | 1.518 |
| -0.490000000000127 | 1.142 | 1.355 | 1.517 |
| -0.480000000000127 | 1.14 | 1.354 | 1.515 |
| -0.470000000000127 | 1.137 | 1.352 | 1.514 |
| -0.460000000000126 | 1.134 | 1.35 | 1.512 |
| -0.450000000000126 | 1.132 | 1.348 | 1.511 |
| -0.440000000000126 | 1.129 | 1.346 | 1.51 |
| -0.430000000000126 | 1.127 | 1.344 | 1.508 |
| -0.420000000000126 | 1.124 | 1.343 | 1.507 |
| -0.410000000000126 | 1.121 | 1.341 | 1.505 |
| -0.400000000000126 | 1.119 | 1.339 | 1.504 |
| -0.390000000000126 | 1.116 | 1.337 | 1.502 |
| -0.380000000000126 | 1.113 | 1.335 | 1.501 |
| -0.370000000000126 | 1.111 | 1.333 | 1.499 |
| -0.360000000000126 | 1.108 | 1.331 | 1.498 |
| -0.350000000000126 | 1.105 | 1.33 | 1.496 |
| -0.340000000000126 | 1.102 | 1.328 | 1.495 |
| -0.330000000000126 | 1.1 | 1.326 | 1.493 |
| -0.320000000000126 | 1.097 | 1.324 | 1.492 |
| -0.310000000000126 | 1.094 | 1.322 | 1.49 |
| -0.300000000000126 | 1.091 | 1.32 | 1.489 |
| -0.290000000000126 | 1.089 | 1.318 | 1.487 |
| -0.280000000000126 | 1.086 | 1.316 | 1.486 |
| -0.270000000000126 | 1.083 | 1.314 | 1.484 |
| -0.260000000000126 | 1.08 | 1.312 | 1.483 |
| -0.250000000000126 | 1.077 | 1.31 | 1.481 |
| -0.240000000000126 | 1.074 | 1.308 | 1.48 |
| -0.230000000000126 | 1.071 | 1.306 | 1.478 |
| -0.220000000000126 | 1.069 | 1.305 | 1.477 |
| -0.210000000000126 | 1.066 | 1.303 | 1.475 |
| -0.200000000000126 | 1.063 | 1.301 | 1.474 |
| -0.190000000000126 | 1.06 | 1.299 | 1.472 |
| -0.180000000000126 | 1.057 | 1.297 | 1.471 |
| -0.170000000000126 | 1.054 | 1.295 | 1.469 |
| -0.160000000000126 | 1.051 | 1.293 | 1.467 |
| -0.150000000000126 | 1.048 | 1.291 | 1.466 |
| -0.140000000000126 | 1.045 | 1.289 | 1.464 |
| -0.130000000000126 | 1.042 | 1.287 | 1.463 |
| -0.120000000000126 | 1.038 | 1.285 | 1.461 |
| -0.110000000000126 | 1.035 | 1.283 | 1.46 |
| -0.100000000000126 | 1.032 | 1.281 | 1.458 |
| -0.0900000000001262 | 1.029 | 1.279 | 1.457 |
| -0.0800000000001262 | 1.026 | 1.277 | 1.455 |
| -0.0700000000001263 | 1.023 | 1.274 | 1.453 |
| -0.0600000000001263 | 1.02 | 1.272 | 1.452 |
| -0.0500000000001263 | 1.016 | 1.27 | 1.45 |
| -0.0400000000001263 | 1.013 | 1.268 | 1.449 |
| -0.0300000000001263 | 1.01 | 1.266 | 1.447 |
| -0.0200000000001263 | 1.007 | 1.264 | 1.445 |
| -0.0100000000001263 | 1.003 | 1.262 | 1.444 |
| -1.26256644028544e-13 | 1 | 1.26 | 1.442 |
| 0.00999999999987374 | 0.997 | 1.258 | 1.441 |
| 0.0199999999998737 | 0.993 | 1.256 | 1.439 |
| 0.0299999999998737 | 0.99 | 1.254 | 1.437 |
| 0.0399999999998737 | 0.986 | 1.251 | 1.436 |
| 0.0499999999998737 | 0.983 | 1.249 | 1.434 |
| 0.0599999999998737 | 0.98 | 1.247 | 1.433 |
| 0.0699999999998737 | 0.976 | 1.245 | 1.431 |
| 0.0799999999998737 | 0.973 | 1.243 | 1.429 |
| 0.0899999999998737 | 0.969 | 1.241 | 1.428 |
| 0.0999999999998737 | 0.965 | 1.239 | 1.426 |
| 0.109999999999874 | 0.962 | 1.236 | 1.424 |
| 0.119999999999874 | 0.958 | 1.234 | 1.423 |
| 0.129999999999874 | 0.955 | 1.232 | 1.421 |
| 0.139999999999874 | 0.951 | 1.23 | 1.419 |
| 0.149999999999874 | 0.947 | 1.228 | 1.418 |
| 0.159999999999874 | 0.944 | 1.225 | 1.416 |
| 0.169999999999874 | 0.94 | 1.223 | 1.414 |
| 0.179999999999874 | 0.936 | 1.221 | 1.413 |
| 0.189999999999874 | 0.932 | 1.219 | 1.411 |
| 0.199999999999874 | 0.928 | 1.216 | 1.409 |
| 0.209999999999874 | 0.924 | 1.214 | 1.408 |
| 0.219999999999874 | 0.921 | 1.212 | 1.406 |
| 0.229999999999874 | 0.917 | 1.21 | 1.404 |
| 0.239999999999874 | 0.913 | 1.207 | 1.403 |
| 0.249999999999874 | 0.909 | 1.205 | 1.401 |
| 0.259999999999874 | 0.905 | 1.203 | 1.399 |
| 0.269999999999874 | 0.9 | 1.2 | 1.398 |
| 0.279999999999874 | 0.896 | 1.198 | 1.396 |
| 0.289999999999874 | 0.892 | 1.196 | 1.394 |
| 0.299999999999874 | 0.888 | 1.193 | 1.392 |
| 0.309999999999874 | 0.884 | 1.191 | 1.391 |
| 0.319999999999874 | 0.879 | 1.189 | 1.389 |
| 0.329999999999874 | 0.875 | 1.186 | 1.387 |
| 0.339999999999874 | 0.871 | 1.184 | 1.386 |
| 0.349999999999874 | 0.866 | 1.182 | 1.384 |
| 0.359999999999874 | 0.862 | 1.179 | 1.382 |
| 0.369999999999874 | 0.857 | 1.177 | 1.38 |
| 0.379999999999874 | 0.853 | 1.174 | 1.379 |
| 0.389999999999874 | 0.848 | 1.172 | 1.377 |
| 0.399999999999874 | 0.843 | 1.17 | 1.375 |
| 0.409999999999874 | 0.839 | 1.167 | 1.373 |
| 0.419999999999874 | 0.834 | 1.165 | 1.372 |
| 0.429999999999874 | 0.829 | 1.162 | 1.37 |
| 0.439999999999874 | 0.824 | 1.16 | 1.368 |
| 0.449999999999874 | 0.819 | 1.157 | 1.366 |
| 0.459999999999874 | 0.814 | 1.155 | 1.364 |
| 0.469999999999874 | 0.809 | 1.152 | 1.363 |
| 0.479999999999874 | 0.804 | 1.15 | 1.361 |
| 0.489999999999874 | 0.799 | 1.147 | 1.359 |
| 0.499999999999874 | 0.794 | 1.145 | 1.357 |
| 0.509999999999874 | 0.788 | 1.142 | 1.355 |
| 0.519999999999874 | 0.783 | 1.14 | 1.354 |
| 0.529999999999874 | 0.777 | 1.137 | 1.352 |
| 0.539999999999874 | 0.772 | 1.134 | 1.35 |
| 0.549999999999874 | 0.766 | 1.132 | 1.348 |
| 0.559999999999874 | 0.761 | 1.129 | 1.346 |
| 0.569999999999874 | 0.755 | 1.127 | 1.344 |
| 0.579999999999874 | 0.749 | 1.124 | 1.343 |
| 0.589999999999874 | 0.743 | 1.121 | 1.341 |
| 0.599999999999874 | 0.737 | 1.119 | 1.339 |
| 0.609999999999874 | 0.731 | 1.116 | 1.337 |
| 0.619999999999874 | 0.724 | 1.113 | 1.335 |
| 0.629999999999874 | 0.718 | 1.111 | 1.333 |
| 0.639999999999874 | 0.711 | 1.108 | 1.331 |
| 0.649999999999874 | 0.705 | 1.105 | 1.33 |
| 0.659999999999874 | 0.698 | 1.102 | 1.328 |
| 0.669999999999874 | 0.691 | 1.1 | 1.326 |
| 0.679999999999874 | 0.684 | 1.097 | 1.324 |
| 0.689999999999874 | 0.677 | 1.094 | 1.322 |
| 0.699999999999874 | 0.669 | 1.091 | 1.32 |
| 0.709999999999874 | 0.662 | 1.089 | 1.318 |
| 0.719999999999874 | 0.654 | 1.086 | 1.316 |
| 0.729999999999874 | 0.646 | 1.083 | 1.314 |
| 0.739999999999874 | 0.638 | 1.08 | 1.312 |
| 0.749999999999874 | 0.63 | 1.077 | 1.31 |
| 0.759999999999874 | 0.621 | 1.074 | 1.308 |
| 0.769999999999874 | 0.613 | 1.071 | 1.306 |
| 0.779999999999874 | 0.604 | 1.069 | 1.305 |
| 0.789999999999874 | 0.594 | 1.066 | 1.303 |
| 0.799999999999874 | 0.585 | 1.063 | 1.301 |
| 0.809999999999874 | 0.575 | 1.06 | 1.299 |
| 0.819999999999874 | 0.565 | 1.057 | 1.297 |
| 0.829999999999874 | 0.554 | 1.054 | 1.295 |
| 0.839999999999874 | 0.543 | 1.051 | 1.293 |
| 0.849999999999874 | 0.531 | 1.048 | 1.291 |
| 0.859999999999874 | 0.519 | 1.045 | 1.289 |
| 0.869999999999874 | 0.507 | 1.042 | 1.287 |
| 0.879999999999874 | 0.493 | 1.038 | 1.285 |
| 0.889999999999874 | 0.479 | 1.035 | 1.283 |
| 0.899999999999874 | 0.464 | 1.032 | 1.281 |
| 0.909999999999874 | 0.448 | 1.029 | 1.279 |
| 0.919999999999874 | 0.431 | 1.026 | 1.277 |
| 0.929999999999874 | 0.412 | 1.023 | 1.274 |
| 0.939999999999874 | 0.391 | 1.02 | 1.272 |
| 0.949999999999874 | 0.368 | 1.016 | 1.27 |
| 0.959999999999874 | 0.342 | 1.013 | 1.268 |
| 0.969999999999874 | 0.311 | 1.01 | 1.266 |
| 0.979999999999874 | 0.271 | 1.007 | 1.264 |
| 0.989999999999874 | 0.215 | 1.003 | 1.262 |
| 0.999999999999874 | 0 | 1 | 1.26 |
| 1.009999999999874 | -0.215 | 0.997 | 1.258 |
| 1.019999999999874 | -0.271 | 0.993 | 1.256 |
| 1.029999999999874 | -0.311 | 0.99 | 1.254 |
| 1.039999999999874 | -0.342 | 0.986 | 1.251 |
| 1.049999999999874 | -0.368 | 0.983 | 1.249 |
| 1.059999999999874 | -0.391 | 0.98 | 1.247 |
| 1.069999999999874 | -0.412 | 0.976 | 1.245 |
| 1.079999999999874 | -0.431 | 0.973 | 1.243 |
| 1.089999999999874 | -0.448 | 0.969 | 1.241 |
| 1.099999999999874 | -0.464 | 0.965 | 1.239 |
| 1.109999999999874 | -0.479 | 0.962 | 1.236 |
| 1.119999999999874 | -0.493 | 0.958 | 1.234 |
| 1.129999999999874 | -0.507 | 0.955 | 1.232 |
| 1.139999999999874 | -0.519 | 0.951 | 1.23 |
| 1.149999999999874 | -0.531 | 0.947 | 1.228 |
| 1.159999999999874 | -0.543 | 0.944 | 1.225 |
| 1.169999999999874 | -0.554 | 0.94 | 1.223 |
| 1.179999999999874 | -0.565 | 0.936 | 1.221 |
| 1.189999999999874 | -0.575 | 0.932 | 1.219 |
| 1.199999999999874 | -0.585 | 0.928 | 1.216 |
| 1.209999999999874 | -0.594 | 0.924 | 1.214 |
| 1.219999999999875 | -0.604 | 0.921 | 1.212 |
| 1.229999999999875 | -0.613 | 0.917 | 1.21 |
| 1.239999999999875 | -0.621 | 0.913 | 1.207 |
| 1.249999999999875 | -0.63 | 0.909 | 1.205 |
| 1.259999999999875 | -0.638 | 0.905 | 1.203 |
| 1.269999999999875 | -0.646 | 0.9 | 1.2 |
| 1.279999999999875 | -0.654 | 0.896 | 1.198 |
| 1.289999999999875 | -0.662 | 0.892 | 1.196 |
| 1.299999999999875 | -0.669 | 0.888 | 1.193 |
| 1.309999999999875 | -0.677 | 0.884 | 1.191 |
| 1.319999999999875 | -0.684 | 0.879 | 1.189 |
| 1.329999999999875 | -0.691 | 0.875 | 1.186 |
| 1.339999999999875 | -0.698 | 0.871 | 1.184 |
| 1.349999999999875 | -0.705 | 0.866 | 1.182 |
| 1.359999999999875 | -0.711 | 0.862 | 1.179 |
| 1.369999999999875 | -0.718 | 0.857 | 1.177 |
| 1.379999999999875 | -0.724 | 0.853 | 1.174 |
| 1.389999999999875 | -0.731 | 0.848 | 1.172 |
| 1.399999999999875 | -0.737 | 0.843 | 1.17 |
| 1.409999999999875 | -0.743 | 0.839 | 1.167 |
| 1.419999999999875 | -0.749 | 0.834 | 1.165 |
| 1.429999999999875 | -0.755 | 0.829 | 1.162 |
| 1.439999999999875 | -0.761 | 0.824 | 1.16 |
| 1.449999999999875 | -0.766 | 0.819 | 1.157 |
| 1.459999999999875 | -0.772 | 0.814 | 1.155 |
| 1.469999999999875 | -0.777 | 0.809 | 1.152 |
| 1.479999999999875 | -0.783 | 0.804 | 1.15 |
| 1.489999999999875 | -0.788 | 0.799 | 1.147 |
| 1.499999999999875 | -0.794 | 0.794 | 1.145 |
| 1.509999999999875 | -0.799 | 0.788 | 1.142 |
| 1.519999999999875 | -0.804 | 0.783 | 1.14 |
| 1.529999999999875 | -0.809 | 0.777 | 1.137 |
| 1.539999999999875 | -0.814 | 0.772 | 1.134 |
| 1.549999999999875 | -0.819 | 0.766 | 1.132 |
| 1.559999999999875 | -0.824 | 0.761 | 1.129 |
| 1.569999999999875 | -0.829 | 0.755 | 1.127 |
| 1.579999999999875 | -0.834 | 0.749 | 1.124 |
| 1.589999999999875 | -0.839 | 0.743 | 1.121 |
| 1.599999999999875 | -0.843 | 0.737 | 1.119 |
| 1.609999999999875 | -0.848 | 0.731 | 1.116 |
| 1.619999999999875 | -0.853 | 0.724 | 1.113 |
| 1.629999999999875 | -0.857 | 0.718 | 1.111 |
| 1.639999999999875 | -0.862 | 0.711 | 1.108 |
| 1.649999999999875 | -0.866 | 0.705 | 1.105 |
| 1.659999999999875 | -0.871 | 0.698 | 1.102 |
| 1.669999999999875 | -0.875 | 0.691 | 1.1 |
| 1.679999999999875 | -0.879 | 0.684 | 1.097 |
| 1.689999999999875 | -0.884 | 0.677 | 1.094 |
| 1.699999999999875 | -0.888 | 0.669 | 1.091 |
| 1.709999999999875 | -0.892 | 0.662 | 1.089 |
| 1.719999999999875 | -0.896 | 0.654 | 1.086 |
| 1.729999999999875 | -0.9 | 0.646 | 1.083 |
| 1.739999999999875 | -0.905 | 0.638 | 1.08 |
| 1.749999999999875 | -0.909 | 0.63 | 1.077 |
| 1.759999999999875 | -0.913 | 0.621 | 1.074 |
| 1.769999999999875 | -0.917 | 0.613 | 1.071 |
| 1.779999999999875 | -0.921 | 0.604 | 1.069 |
| 1.789999999999875 | -0.924 | 0.594 | 1.066 |
| 1.799999999999875 | -0.928 | 0.585 | 1.063 |
| 1.809999999999875 | -0.932 | 0.575 | 1.06 |
| 1.819999999999875 | -0.936 | 0.565 | 1.057 |
| 1.829999999999875 | -0.94 | 0.554 | 1.054 |
| 1.839999999999875 | -0.944 | 0.543 | 1.051 |
| 1.849999999999875 | -0.947 | 0.531 | 1.048 |
| 1.859999999999875 | -0.951 | 0.519 | 1.045 |
| 1.869999999999875 | -0.955 | 0.507 | 1.042 |
| 1.879999999999875 | -0.958 | 0.493 | 1.038 |
| 1.889999999999875 | -0.962 | 0.479 | 1.035 |
| 1.899999999999875 | -0.965 | 0.464 | 1.032 |
| 1.909999999999875 | -0.969 | 0.448 | 1.029 |
| 1.919999999999875 | -0.973 | 0.431 | 1.026 |
| 1.929999999999875 | -0.976 | 0.412 | 1.023 |
| 1.939999999999875 | -0.98 | 0.391 | 1.02 |
| 1.949999999999875 | -0.983 | 0.368 | 1.016 |
| 1.959999999999875 | -0.986 | 0.342 | 1.013 |
| 1.969999999999875 | -0.99 | 0.311 | 1.01 |
| 1.979999999999875 | -0.993 | 0.271 | 1.007 |
| 1.989999999999875 | -0.997 | 0.215 | 1.003 |
| 1.999999999999875 | -1 | 0 | 1 |
| 2.009999999999875 | -1.003 | -0.215 | 0.997 |
| 2.019999999999875 | -1.007 | -0.271 | 0.993 |
| 2.029999999999875 | -1.01 | -0.311 | 0.99 |
| 2.039999999999874 | -1.013 | -0.342 | 0.986 |
| 2.049999999999874 | -1.016 | -0.368 | 0.983 |
| 2.059999999999874 | -1.02 | -0.391 | 0.98 |
| 2.069999999999874 | -1.023 | -0.412 | 0.976 |
| 2.079999999999873 | -1.026 | -0.431 | 0.973 |
| 2.089999999999873 | -1.029 | -0.448 | 0.969 |
| 2.099999999999873 | -1.032 | -0.464 | 0.965 |
| 2.109999999999873 | -1.035 | -0.479 | 0.962 |
| 2.119999999999873 | -1.038 | -0.493 | 0.958 |
| 2.129999999999872 | -1.042 | -0.507 | 0.955 |
| 2.139999999999872 | -1.045 | -0.519 | 0.951 |
| 2.149999999999872 | -1.048 | -0.531 | 0.947 |
| 2.159999999999872 | -1.051 | -0.543 | 0.944 |
| 2.169999999999872 | -1.054 | -0.554 | 0.94 |
| 2.179999999999871 | -1.057 | -0.565 | 0.936 |
| 2.189999999999871 | -1.06 | -0.575 | 0.932 |
| 2.199999999999871 | -1.063 | -0.585 | 0.928 |
| 2.209999999999871 | -1.066 | -0.594 | 0.924 |
| 2.219999999999871 | -1.069 | -0.604 | 0.921 |
| 2.22999999999987 | -1.071 | -0.613 | 0.917 |
| 2.23999999999987 | -1.074 | -0.621 | 0.913 |
| 2.24999999999987 | -1.077 | -0.63 | 0.909 |
| 2.25999999999987 | -1.08 | -0.638 | 0.905 |
| 2.269999999999869 | -1.083 | -0.646 | 0.9 |
| 2.279999999999869 | -1.086 | -0.654 | 0.896 |
| 2.289999999999869 | -1.089 | -0.662 | 0.892 |
| 2.299999999999869 | -1.091 | -0.669 | 0.888 |
| 2.309999999999869 | -1.094 | -0.677 | 0.884 |
| 2.319999999999868 | -1.097 | -0.684 | 0.879 |
| 2.329999999999868 | -1.1 | -0.691 | 0.875 |
| 2.339999999999868 | -1.102 | -0.698 | 0.871 |
| 2.349999999999868 | -1.105 | -0.705 | 0.866 |
| 2.359999999999867 | -1.108 | -0.711 | 0.862 |
| 2.369999999999867 | -1.111 | -0.718 | 0.857 |
| 2.379999999999867 | -1.113 | -0.724 | 0.853 |
| 2.389999999999867 | -1.116 | -0.731 | 0.848 |
| 2.399999999999867 | -1.119 | -0.737 | 0.843 |
| 2.409999999999866 | -1.121 | -0.743 | 0.839 |
| 2.419999999999866 | -1.124 | -0.749 | 0.834 |
| 2.429999999999866 | -1.127 | -0.755 | 0.829 |
| 2.439999999999866 | -1.129 | -0.761 | 0.824 |
| 2.449999999999866 | -1.132 | -0.766 | 0.819 |
| 2.459999999999865 | -1.134 | -0.772 | 0.814 |
| 2.469999999999865 | -1.137 | -0.777 | 0.809 |
| 2.479999999999865 | -1.14 | -0.783 | 0.804 |
| 2.489999999999865 | -1.142 | -0.788 | 0.799 |
| 2.499999999999865 | -1.145 | -0.794 | 0.794 |
| 2.509999999999864 | -1.147 | -0.799 | 0.788 |
| 2.519999999999864 | -1.15 | -0.804 | 0.783 |
| 2.529999999999864 | -1.152 | -0.809 | 0.777 |
| 2.539999999999864 | -1.155 | -0.814 | 0.772 |
| 2.549999999999863 | -1.157 | -0.819 | 0.766 |
| 2.559999999999863 | -1.16 | -0.824 | 0.761 |
| 2.569999999999863 | -1.162 | -0.829 | 0.755 |
| 2.579999999999863 | -1.165 | -0.834 | 0.749 |
| 2.589999999999863 | -1.167 | -0.839 | 0.743 |
| 2.599999999999862 | -1.17 | -0.843 | 0.737 |
| 2.609999999999862 | -1.172 | -0.848 | 0.731 |
| 2.619999999999862 | -1.174 | -0.853 | 0.724 |
| 2.629999999999862 | -1.177 | -0.857 | 0.718 |
| 2.639999999999861 | -1.179 | -0.862 | 0.711 |
| 2.649999999999861 | -1.182 | -0.866 | 0.705 |
| 2.659999999999861 | -1.184 | -0.871 | 0.698 |
| 2.669999999999861 | -1.186 | -0.875 | 0.691 |
| 2.679999999999861 | -1.189 | -0.879 | 0.684 |
| 2.68999999999986 | -1.191 | -0.884 | 0.677 |
| 2.69999999999986 | -1.193 | -0.888 | 0.669 |
| 2.70999999999986 | -1.196 | -0.892 | 0.662 |
| 2.71999999999986 | -1.198 | -0.896 | 0.654 |
| 2.72999999999986 | -1.2 | -0.9 | 0.646 |
| 2.739999999999859 | -1.203 | -0.905 | 0.638 |
| 2.749999999999859 | -1.205 | -0.909 | 0.63 |
| 2.759999999999859 | -1.207 | -0.913 | 0.621 |
| 2.769999999999859 | -1.21 | -0.917 | 0.613 |
| 2.779999999999859 | -1.212 | -0.921 | 0.604 |
| 2.789999999999858 | -1.214 | -0.924 | 0.594 |
| 2.799999999999858 | -1.216 | -0.928 | 0.585 |
| 2.809999999999858 | -1.219 | -0.932 | 0.575 |
| 2.819999999999858 | -1.221 | -0.936 | 0.565 |
| 2.829999999999857 | -1.223 | -0.94 | 0.554 |
| 2.839999999999857 | -1.225 | -0.944 | 0.543 |
| 2.849999999999857 | -1.228 | -0.947 | 0.531 |
| 2.859999999999857 | -1.23 | -0.951 | 0.519 |
| 2.869999999999857 | -1.232 | -0.955 | 0.507 |
| 2.879999999999856 | -1.234 | -0.958 | 0.493 |
| 2.889999999999856 | -1.236 | -0.962 | 0.479 |
| 2.899999999999856 | -1.239 | -0.965 | 0.464 |
| 2.909999999999856 | -1.241 | -0.969 | 0.448 |
| 2.919999999999856 | -1.243 | -0.973 | 0.431 |
| 2.929999999999855 | -1.245 | -0.976 | 0.412 |
| 2.939999999999855 | -1.247 | -0.98 | 0.391 |
| 2.949999999999855 | -1.249 | -0.983 | 0.368 |
| 2.959999999999855 | -1.251 | -0.986 | 0.342 |
| 2.969999999999854 | -1.254 | -0.99 | 0.311 |
| 2.979999999999854 | -1.256 | -0.993 | 0.271 |
| 2.989999999999854 | -1.258 | -0.997 | 0.215 |
| 2.999999999999854 | -1.26 | -1 | 0 |
| 3.009999999999854 | -1.262 | -1.003 | -0.215 |
| 3.019999999999853 | -1.264 | -1.007 | -0.271 |
| 3.029999999999853 | -1.266 | -1.01 | -0.311 |
| 3.039999999999853 | -1.268 | -1.013 | -0.342 |
| 3.049999999999853 | -1.27 | -1.016 | -0.368 |
| 3.059999999999853 | -1.272 | -1.02 | -0.391 |
| 3.069999999999852 | -1.274 | -1.023 | -0.412 |
| 3.079999999999852 | -1.277 | -1.026 | -0.431 |
| 3.089999999999852 | -1.279 | -1.029 | -0.448 |
| 3.099999999999852 | -1.281 | -1.032 | -0.464 |
| 3.109999999999852 | -1.283 | -1.035 | -0.479 |
| 3.119999999999851 | -1.285 | -1.038 | -0.493 |
| 3.129999999999851 | -1.287 | -1.042 | -0.507 |
| 3.139999999999851 | -1.289 | -1.045 | -0.519 |
| 3.149999999999851 | -1.291 | -1.048 | -0.531 |
| 3.15999999999985 | -1.293 | -1.051 | -0.543 |
| 3.16999999999985 | -1.295 | -1.054 | -0.554 |
| 3.17999999999985 | -1.297 | -1.057 | -0.565 |
| 3.18999999999985 | -1.299 | -1.06 | -0.575 |
| 3.19999999999985 | -1.301 | -1.063 | -0.585 |
| 3.209999999999849 | -1.303 | -1.066 | -0.594 |
| 3.219999999999849 | -1.305 | -1.069 | -0.604 |
| 3.229999999999849 | -1.306 | -1.071 | -0.613 |
| 3.239999999999849 | -1.308 | -1.074 | -0.621 |
| 3.249999999999849 | -1.31 | -1.077 | -0.63 |
| 3.259999999999848 | -1.312 | -1.08 | -0.638 |
| 3.269999999999848 | -1.314 | -1.083 | -0.646 |
| 3.279999999999848 | -1.316 | -1.086 | -0.654 |
| 3.289999999999848 | -1.318 | -1.089 | -0.662 |
| 3.299999999999847 | -1.32 | -1.091 | -0.669 |
| 3.309999999999847 | -1.322 | -1.094 | -0.677 |
| 3.319999999999847 | -1.324 | -1.097 | -0.684 |
| 3.329999999999847 | -1.326 | -1.1 | -0.691 |
| 3.339999999999847 | -1.328 | -1.102 | -0.698 |
| 3.349999999999846 | -1.33 | -1.105 | -0.705 |
| 3.359999999999846 | -1.331 | -1.108 | -0.711 |
| 3.369999999999846 | -1.333 | -1.111 | -0.718 |
| 3.379999999999846 | -1.335 | -1.113 | -0.724 |
| 3.389999999999846 | -1.337 | -1.116 | -0.731 |
| 3.399999999999845 | -1.339 | -1.119 | -0.737 |
| 3.409999999999845 | -1.341 | -1.121 | -0.743 |
| 3.419999999999845 | -1.343 | -1.124 | -0.749 |
| 3.429999999999845 | -1.344 | -1.127 | -0.755 |
| 3.439999999999844 | -1.346 | -1.129 | -0.761 |
| 3.449999999999844 | -1.348 | -1.132 | -0.766 |
| 3.459999999999844 | -1.35 | -1.134 | -0.772 |
| 3.469999999999844 | -1.352 | -1.137 | -0.777 |
| 3.479999999999844 | -1.354 | -1.14 | -0.783 |
| 3.489999999999843 | -1.355 | -1.142 | -0.788 |
| 3.499999999999843 | -1.357 | -1.145 | -0.794 |
| 3.509999999999843 | -1.359 | -1.147 | -0.799 |
| 3.519999999999843 | -1.361 | -1.15 | -0.804 |
| 3.529999999999843 | -1.363 | -1.152 | -0.809 |
| 3.539999999999842 | -1.364 | -1.155 | -0.814 |
| 3.549999999999842 | -1.366 | -1.157 | -0.819 |
| 3.559999999999842 | -1.368 | -1.16 | -0.824 |
| 3.569999999999842 | -1.37 | -1.162 | -0.829 |
| 3.579999999999842 | -1.372 | -1.165 | -0.834 |
| 3.589999999999841 | -1.373 | -1.167 | -0.839 |
| 3.599999999999841 | -1.375 | -1.17 | -0.843 |
| 3.609999999999841 | -1.377 | -1.172 | -0.848 |
| 3.619999999999841 | -1.379 | -1.174 | -0.853 |
| 3.62999999999984 | -1.38 | -1.177 | -0.857 |
| 3.63999999999984 | -1.382 | -1.179 | -0.862 |
| 3.64999999999984 | -1.384 | -1.182 | -0.866 |
| 3.65999999999984 | -1.386 | -1.184 | -0.871 |
| 3.66999999999984 | -1.387 | -1.186 | -0.875 |
| 3.679999999999839 | -1.389 | -1.189 | -0.879 |
| 3.689999999999839 | -1.391 | -1.191 | -0.884 |
| 3.699999999999839 | -1.392 | -1.193 | -0.888 |
| 3.709999999999839 | -1.394 | -1.196 | -0.892 |
| 3.719999999999838 | -1.396 | -1.198 | -0.896 |
| 3.729999999999838 | -1.398 | -1.2 | -0.9 |
| 3.739999999999838 | -1.399 | -1.203 | -0.905 |
| 3.749999999999838 | -1.401 | -1.205 | -0.909 |
| 3.759999999999838 | -1.403 | -1.207 | -0.913 |
| 3.769999999999837 | -1.404 | -1.21 | -0.917 |
| 3.779999999999837 | -1.406 | -1.212 | -0.921 |
| 3.789999999999837 | -1.408 | -1.214 | -0.924 |
| 3.799999999999837 | -1.409 | -1.216 | -0.928 |
| 3.809999999999837 | -1.411 | -1.219 | -0.932 |
| 3.819999999999836 | -1.413 | -1.221 | -0.936 |
| 3.829999999999836 | -1.414 | -1.223 | -0.94 |
| 3.839999999999836 | -1.416 | -1.225 | -0.944 |
| 3.849999999999836 | -1.418 | -1.228 | -0.947 |
| 3.859999999999836 | -1.419 | -1.23 | -0.951 |
| 3.869999999999835 | -1.421 | -1.232 | -0.955 |
| 3.879999999999835 | -1.423 | -1.234 | -0.958 |
| 3.889999999999835 | -1.424 | -1.236 | -0.962 |
| 3.899999999999835 | -1.426 | -1.239 | -0.965 |
| 3.909999999999834 | -1.428 | -1.241 | -0.969 |
| 3.919999999999834 | -1.429 | -1.243 | -0.973 |
| 3.929999999999834 | -1.431 | -1.245 | -0.976 |
| 3.939999999999834 | -1.433 | -1.247 | -0.98 |
| 3.949999999999834 | -1.434 | -1.249 | -0.983 |
| 3.959999999999833 | -1.436 | -1.251 | -0.986 |
| 3.969999999999833 | -1.437 | -1.254 | -0.99 |
| 3.979999999999833 | -1.439 | -1.256 | -0.993 |
| 3.989999999999833 | -1.441 | -1.258 | -0.997 |
| 3.999999999999833 | -1.442 | -1.26 | -1 |
| 4.009999999999832 | -1.444 | -1.262 | -1.003 |
| 4.019999999999832 | -1.445 | -1.264 | -1.007 |
| 4.029999999999832 | -1.447 | -1.266 | -1.01 |
| 4.039999999999832 | -1.449 | -1.268 | -1.013 |
| 4.049999999999831 | -1.45 | -1.27 | -1.016 |
| 4.059999999999831 | -1.452 | -1.272 | -1.02 |
| 4.069999999999831 | -1.453 | -1.274 | -1.023 |
| 4.07999999999983 | -1.455 | -1.277 | -1.026 |
| 4.08999999999983 | -1.457 | -1.279 | -1.029 |
| 4.09999999999983 | -1.458 | -1.281 | -1.032 |
| 4.10999999999983 | -1.46 | -1.283 | -1.035 |
| 4.11999999999983 | -1.461 | -1.285 | -1.038 |
| 4.12999999999983 | -1.463 | -1.287 | -1.042 |
| 4.13999999999983 | -1.464 | -1.289 | -1.045 |
| 4.14999999999983 | -1.466 | -1.291 | -1.048 |
| 4.15999999999983 | -1.467 | -1.293 | -1.051 |
| 4.16999999999983 | -1.469 | -1.295 | -1.054 |
| 4.17999999999983 | -1.471 | -1.297 | -1.057 |
| 4.189999999999828 | -1.472 | -1.299 | -1.06 |
| 4.199999999999828 | -1.474 | -1.301 | -1.063 |
| 4.209999999999828 | -1.475 | -1.303 | -1.066 |
| 4.219999999999828 | -1.477 | -1.305 | -1.069 |
| 4.229999999999828 | -1.478 | -1.306 | -1.071 |
| 4.239999999999827 | -1.48 | -1.308 | -1.074 |
| 4.249999999999827 | -1.481 | -1.31 | -1.077 |
| 4.259999999999827 | -1.483 | -1.312 | -1.08 |
| 4.269999999999827 | -1.484 | -1.314 | -1.083 |
| 4.279999999999827 | -1.486 | -1.316 | -1.086 |
| 4.289999999999826 | -1.487 | -1.318 | -1.089 |
| 4.299999999999826 | -1.489 | -1.32 | -1.091 |
| 4.309999999999826 | -1.49 | -1.322 | -1.094 |
| 4.319999999999826 | -1.492 | -1.324 | -1.097 |
| 4.329999999999825 | -1.493 | -1.326 | -1.1 |
| 4.339999999999825 | -1.495 | -1.328 | -1.102 |
| 4.349999999999825 | -1.496 | -1.33 | -1.105 |
| 4.359999999999825 | -1.498 | -1.331 | -1.108 |
| 4.369999999999825 | -1.499 | -1.333 | -1.111 |
| 4.379999999999824 | -1.501 | -1.335 | -1.113 |
| 4.389999999999824 | -1.502 | -1.337 | -1.116 |
| 4.399999999999824 | -1.504 | -1.339 | -1.119 |
| 4.409999999999824 | -1.505 | -1.341 | -1.121 |
| 4.419999999999824 | -1.507 | -1.343 | -1.124 |
| 4.429999999999823 | -1.508 | -1.344 | -1.127 |
| 4.439999999999823 | -1.51 | -1.346 | -1.129 |
| 4.449999999999823 | -1.511 | -1.348 | -1.132 |
| 4.459999999999823 | -1.512 | -1.35 | -1.134 |
| 4.469999999999822 | -1.514 | -1.352 | -1.137 |
| 4.479999999999822 | -1.515 | -1.354 | -1.14 |
| 4.489999999999822 | -1.517 | -1.355 | -1.142 |
| 4.499999999999822 | -1.518 | -1.357 | -1.145 |
| 4.509999999999822 | -1.52 | -1.359 | -1.147 |
| 4.519999999999821 | -1.521 | -1.361 | -1.15 |
| 4.529999999999821 | -1.523 | -1.363 | -1.152 |
| 4.53999999999982 | -1.524 | -1.364 | -1.155 |
| 4.54999999999982 | -1.525 | -1.366 | -1.157 |
| 4.55999999999982 | -1.527 | -1.368 | -1.16 |
| 4.56999999999982 | -1.528 | -1.37 | -1.162 |
| 4.57999999999982 | -1.53 | -1.372 | -1.165 |
| 4.58999999999982 | -1.531 | -1.373 | -1.167 |
| 4.59999999999982 | -1.533 | -1.375 | -1.17 |
| 4.60999999999982 | -1.534 | -1.377 | -1.172 |
| 4.61999999999982 | -1.535 | -1.379 | -1.174 |
| 4.629999999999819 | -1.537 | -1.38 | -1.177 |
| 4.63999999999982 | -1.538 | -1.382 | -1.179 |
| 4.64999999999982 | -1.54 | -1.384 | -1.182 |
| 4.659999999999819 | -1.541 | -1.386 | -1.184 |
| 4.669999999999819 | -1.542 | -1.387 | -1.186 |
| 4.679999999999818 | -1.544 | -1.389 | -1.189 |
| 4.689999999999818 | -1.545 | -1.391 | -1.191 |
| 4.699999999999818 | -1.547 | -1.392 | -1.193 |
| 4.709999999999817 | -1.548 | -1.394 | -1.196 |
| 4.719999999999817 | -1.549 | -1.396 | -1.198 |
| 4.729999999999817 | -1.551 | -1.398 | -1.2 |
| 4.739999999999817 | -1.552 | -1.399 | -1.203 |
| 4.749999999999816 | -1.554 | -1.401 | -1.205 |
| 4.759999999999816 | -1.555 | -1.403 | -1.207 |
| 4.769999999999816 | -1.556 | -1.404 | -1.21 |
| 4.779999999999816 | -1.558 | -1.406 | -1.212 |
| 4.789999999999816 | -1.559 | -1.408 | -1.214 |
| 4.799999999999815 | -1.56 | -1.409 | -1.216 |
| 4.809999999999815 | -1.562 | -1.411 | -1.219 |
| 4.819999999999815 | -1.563 | -1.413 | -1.221 |
| 4.829999999999815 | -1.565 | -1.414 | -1.223 |
| 4.839999999999815 | -1.566 | -1.416 | -1.225 |
| 4.849999999999814 | -1.567 | -1.418 | -1.228 |
| 4.859999999999814 | -1.569 | -1.419 | -1.23 |
| 4.869999999999814 | -1.57 | -1.421 | -1.232 |
| 4.879999999999814 | -1.571 | -1.423 | -1.234 |
| 4.889999999999814 | -1.573 | -1.424 | -1.236 |
| 4.899999999999814 | -1.574 | -1.426 | -1.239 |
| 4.909999999999813 | -1.575 | -1.428 | -1.241 |
| 4.919999999999813 | -1.577 | -1.429 | -1.243 |
| 4.929999999999813 | -1.578 | -1.431 | -1.245 |
| 4.939999999999812 | -1.579 | -1.433 | -1.247 |
| 4.949999999999812 | -1.581 | -1.434 | -1.249 |
| 4.959999999999812 | -1.582 | -1.436 | -1.251 |
| 4.969999999999812 | -1.583 | -1.437 | -1.254 |
| 4.979999999999812 | -1.585 | -1.439 | -1.256 |
| 4.989999999999811 | -1.586 | -1.441 | -1.258 |
| 4.999999999999811 | -1.587 | -1.442 | -1.26 |
| 5.009999999999811 | -1.589 | -1.444 | -1.262 |
| 5.019999999999811 | -1.59 | -1.445 | -1.264 |
| 5.029999999999811 | -1.591 | -1.447 | -1.266 |
| 5.03999999999981 | -1.593 | -1.449 | -1.268 |
| 5.04999999999981 | -1.594 | -1.45 | -1.27 |
| 5.05999999999981 | -1.595 | -1.452 | -1.272 |
| 5.06999999999981 | -1.597 | -1.453 | -1.274 |
| 5.07999999999981 | -1.598 | -1.455 | -1.277 |
| 5.08999999999981 | -1.599 | -1.457 | -1.279 |
| 5.09999999999981 | -1.601 | -1.458 | -1.281 |
| 5.10999999999981 | -1.602 | -1.46 | -1.283 |
| 5.11999999999981 | -1.603 | -1.461 | -1.285 |
| 5.129999999999809 | -1.604 | -1.463 | -1.287 |
| 5.139999999999808 | -1.606 | -1.464 | -1.289 |
| 5.149999999999808 | -1.607 | -1.466 | -1.291 |
| 5.159999999999808 | -1.608 | -1.467 | -1.293 |
| 5.169999999999808 | -1.61 | -1.469 | -1.295 |
| 5.179999999999807 | -1.611 | -1.471 | -1.297 |
| 5.189999999999807 | -1.612 | -1.472 | -1.299 |
| 5.199999999999807 | -1.613 | -1.474 | -1.301 |
| 5.209999999999807 | -1.615 | -1.475 | -1.303 |
| 5.219999999999807 | -1.616 | -1.477 | -1.305 |
| 5.229999999999806 | -1.617 | -1.478 | -1.306 |
| 5.239999999999806 | -1.619 | -1.48 | -1.308 |
| 5.249999999999806 | -1.62 | -1.481 | -1.31 |
| 5.259999999999806 | -1.621 | -1.483 | -1.312 |
| 5.269999999999805 | -1.622 | -1.484 | -1.314 |
| 5.279999999999805 | -1.624 | -1.486 | -1.316 |
| 5.289999999999805 | -1.625 | -1.487 | -1.318 |
| 5.299999999999805 | -1.626 | -1.489 | -1.32 |
| 5.309999999999805 | -1.627 | -1.49 | -1.322 |
| 5.319999999999804 | -1.629 | -1.492 | -1.324 |
| 5.329999999999804 | -1.63 | -1.493 | -1.326 |
| 5.339999999999804 | -1.631 | -1.495 | -1.328 |
| 5.349999999999804 | -1.632 | -1.496 | -1.33 |
| 5.359999999999804 | -1.634 | -1.498 | -1.331 |
| 5.369999999999804 | -1.635 | -1.499 | -1.333 |
| 5.379999999999803 | -1.636 | -1.501 | -1.335 |
| 5.389999999999803 | -1.637 | -1.502 | -1.337 |
| 5.399999999999803 | -1.639 | -1.504 | -1.339 |
| 5.409999999999802 | -1.64 | -1.505 | -1.341 |
| 5.419999999999802 | -1.641 | -1.507 | -1.343 |
| 5.429999999999802 | -1.642 | -1.508 | -1.344 |
| 5.439999999999802 | -1.644 | -1.51 | -1.346 |
| 5.449999999999802 | -1.645 | -1.511 | -1.348 |
| 5.459999999999801 | -1.646 | -1.512 | -1.35 |
| 5.469999999999801 | -1.647 | -1.514 | -1.352 |
| 5.4799999999998 | -1.649 | -1.515 | -1.354 |
| 5.4899999999998 | -1.65 | -1.517 | -1.355 |
| 5.4999999999998 | -1.651 | -1.518 | -1.357 |
| 5.5099999999998 | -1.652 | -1.52 | -1.359 |
| 5.5199999999998 | -1.653 | -1.521 | -1.361 |
| 5.5299999999998 | -1.655 | -1.523 | -1.363 |
| 5.5399999999998 | -1.656 | -1.524 | -1.364 |
| 5.5499999999998 | -1.657 | -1.525 | -1.366 |
| 5.5599999999998 | -1.658 | -1.527 | -1.368 |
| 5.5699999999998 | -1.659 | -1.528 | -1.37 |
| 5.5799999999998 | -1.661 | -1.53 | -1.372 |
| 5.5899999999998 | -1.662 | -1.531 | -1.373 |
| 5.599999999999799 | -1.663 | -1.533 | -1.375 |
| 5.609999999999799 | -1.664 | -1.534 | -1.377 |
| 5.619999999999798 | -1.666 | -1.535 | -1.379 |
| 5.629999999999798 | -1.667 | -1.537 | -1.38 |
| 5.639999999999798 | -1.668 | -1.538 | -1.382 |
| 5.649999999999798 | -1.669 | -1.54 | -1.384 |
| 5.659999999999798 | -1.67 | -1.541 | -1.386 |
| 5.669999999999797 | -1.671 | -1.542 | -1.387 |
| 5.679999999999797 | -1.673 | -1.544 | -1.389 |
| 5.689999999999797 | -1.674 | -1.545 | -1.391 |
| 5.699999999999797 | -1.675 | -1.547 | -1.392 |
| 5.709999999999796 | -1.676 | -1.548 | -1.394 |
| 5.719999999999796 | -1.677 | -1.549 | -1.396 |
| 5.729999999999796 | -1.679 | -1.551 | -1.398 |
| 5.739999999999795 | -1.68 | -1.552 | -1.399 |
| 5.749999999999795 | -1.681 | -1.554 | -1.401 |
| 5.759999999999795 | -1.682 | -1.555 | -1.403 |
| 5.769999999999795 | -1.683 | -1.556 | -1.404 |
| 5.779999999999795 | -1.685 | -1.558 | -1.406 |
| 5.789999999999794 | -1.686 | -1.559 | -1.408 |
| 5.799999999999794 | -1.687 | -1.56 | -1.409 |
| 5.809999999999794 | -1.688 | -1.562 | -1.411 |
| 5.819999999999794 | -1.689 | -1.563 | -1.413 |
| 5.829999999999794 | -1.69 | -1.565 | -1.414 |
| 5.839999999999794 | -1.692 | -1.566 | -1.416 |
| 5.849999999999794 | -1.693 | -1.567 | -1.418 |
| 5.859999999999793 | -1.694 | -1.569 | -1.419 |
| 5.869999999999793 | -1.695 | -1.57 | -1.421 |
| 5.879999999999793 | -1.696 | -1.571 | -1.423 |
| 5.889999999999793 | -1.697 | -1.573 | -1.424 |
| 5.899999999999792 | -1.698 | -1.574 | -1.426 |
| 5.909999999999792 | -1.7 | -1.575 | -1.428 |
| 5.919999999999792 | -1.701 | -1.577 | -1.429 |
| 5.929999999999792 | -1.702 | -1.578 | -1.431 |
| 5.939999999999791 | -1.703 | -1.579 | -1.433 |
| 5.949999999999791 | -1.704 | -1.581 | -1.434 |
| 5.959999999999791 | -1.705 | -1.582 | -1.436 |
| 5.969999999999791 | -1.707 | -1.583 | -1.437 |
| 5.97999999999979 | -1.708 | -1.585 | -1.439 |
| 5.98999999999979 | -1.709 | -1.586 | -1.441 |
| 5.99999999999979 | -1.71 | -1.587 | -1.442 |
| 6.00999999999979 | -1.711 | -1.589 | -1.444 |
| 6.01999999999979 | -1.712 | -1.59 | -1.445 |
| 6.02999999999979 | -1.713 | -1.591 | -1.447 |
| 6.03999999999979 | -1.715 | -1.593 | -1.449 |
| 6.04999999999979 | -1.716 | -1.594 | -1.45 |
| 6.05999999999979 | -1.717 | -1.595 | -1.452 |
| 6.069999999999789 | -1.718 | -1.597 | -1.453 |
| 6.079999999999788 | -1.719 | -1.598 | -1.455 |
| 6.089999999999788 | -1.72 | -1.599 | -1.457 |
| 6.099999999999788 | -1.721 | -1.601 | -1.458 |
| 6.109999999999788 | -1.722 | -1.602 | -1.46 |
| 6.119999999999788 | -1.724 | -1.603 | -1.461 |
| 6.129999999999788 | -1.725 | -1.604 | -1.463 |
| 6.139999999999787 | -1.726 | -1.606 | -1.464 |
| 6.149999999999787 | -1.727 | -1.607 | -1.466 |
| 6.159999999999787 | -1.728 | -1.608 | -1.467 |
| 6.169999999999787 | -1.729 | -1.61 | -1.469 |
| 6.179999999999786 | -1.73 | -1.611 | -1.471 |
| 6.189999999999786 | -1.731 | -1.612 | -1.472 |
| 6.199999999999786 | -1.732 | -1.613 | -1.474 |
| 6.209999999999785 | -1.734 | -1.615 | -1.475 |
| 6.219999999999785 | -1.735 | -1.616 | -1.477 |
| 6.229999999999785 | -1.736 | -1.617 | -1.478 |
| 6.239999999999785 | -1.737 | -1.619 | -1.48 |
| 6.249999999999785 | -1.738 | -1.62 | -1.481 |
| 6.259999999999784 | -1.739 | -1.621 | -1.483 |
| 6.269999999999784 | -1.74 | -1.622 | -1.484 |
| 6.279999999999784 | -1.741 | -1.624 | -1.486 |
| 6.289999999999784 | -1.742 | -1.625 | -1.487 |
| 6.299999999999784 | -1.744 | -1.626 | -1.489 |
| 6.309999999999784 | -1.745 | -1.627 | -1.49 |
| 6.319999999999784 | -1.746 | -1.629 | -1.492 |
| 6.329999999999783 | -1.747 | -1.63 | -1.493 |
| 6.339999999999783 | -1.748 | -1.631 | -1.495 |
| 6.349999999999783 | -1.749 | -1.632 | -1.496 |
| 6.359999999999783 | -1.75 | -1.634 | -1.498 |
| 6.369999999999782 | -1.751 | -1.635 | -1.499 |
| 6.379999999999782 | -1.752 | -1.636 | -1.501 |
| 6.389999999999782 | -1.753 | -1.637 | -1.502 |
| 6.399999999999782 | -1.754 | -1.639 | -1.504 |
| 6.409999999999781 | -1.755 | -1.64 | -1.505 |
| 6.419999999999781 | -1.757 | -1.641 | -1.507 |
| 6.429999999999781 | -1.758 | -1.642 | -1.508 |
| 6.43999999999978 | -1.759 | -1.644 | -1.51 |
| 6.44999999999978 | -1.76 | -1.645 | -1.511 |
| 6.45999999999978 | -1.761 | -1.646 | -1.512 |
| 6.46999999999978 | -1.762 | -1.647 | -1.514 |
| 6.47999999999978 | -1.763 | -1.649 | -1.515 |
| 6.48999999999978 | -1.764 | -1.65 | -1.517 |
| 6.49999999999978 | -1.765 | -1.651 | -1.518 |
| 6.50999999999978 | -1.766 | -1.652 | -1.52 |
| 6.51999999999978 | -1.767 | -1.653 | -1.521 |
| 6.52999999999978 | -1.768 | -1.655 | -1.523 |
| 6.539999999999778 | -1.769 | -1.656 | -1.524 |
| 6.549999999999778 | -1.771 | -1.657 | -1.525 |
| 6.559999999999778 | -1.772 | -1.658 | -1.527 |
| 6.569999999999778 | -1.773 | -1.659 | -1.528 |
| 6.579999999999778 | -1.774 | -1.661 | -1.53 |
| 6.589999999999777 | -1.775 | -1.662 | -1.531 |
| 6.599999999999777 | -1.776 | -1.663 | -1.533 |
| 6.609999999999777 | -1.777 | -1.664 | -1.534 |
| 6.619999999999777 | -1.778 | -1.666 | -1.535 |
| 6.629999999999777 | -1.779 | -1.667 | -1.537 |
| 6.639999999999776 | -1.78 | -1.668 | -1.538 |
| 6.649999999999776 | -1.781 | -1.669 | -1.54 |
| 6.659999999999776 | -1.782 | -1.67 | -1.541 |
| 6.669999999999776 | -1.783 | -1.671 | -1.542 |
| 6.679999999999775 | -1.784 | -1.673 | -1.544 |
| 6.689999999999775 | -1.785 | -1.674 | -1.545 |
| 6.699999999999775 | -1.786 | -1.675 | -1.547 |
| 6.709999999999775 | -1.787 | -1.676 | -1.548 |
| 6.719999999999774 | -1.788 | -1.677 | -1.549 |
| 6.729999999999774 | -1.789 | -1.679 | -1.551 |
| 6.739999999999774 | -1.79 | -1.68 | -1.552 |
| 6.749999999999774 | -1.792 | -1.681 | -1.554 |
| 6.759999999999774 | -1.793 | -1.682 | -1.555 |
| 6.769999999999774 | -1.794 | -1.683 | -1.556 |
| 6.779999999999773 | -1.795 | -1.685 | -1.558 |
| 6.789999999999773 | -1.796 | -1.686 | -1.559 |
| 6.799999999999773 | -1.797 | -1.687 | -1.56 |
| 6.809999999999773 | -1.798 | -1.688 | -1.562 |
| 6.819999999999773 | -1.799 | -1.689 | -1.563 |
| 6.829999999999773 | -1.8 | -1.69 | -1.565 |
| 6.839999999999772 | -1.801 | -1.692 | -1.566 |
| 6.849999999999772 | -1.802 | -1.693 | -1.567 |
| 6.859999999999772 | -1.803 | -1.694 | -1.569 |
| 6.869999999999772 | -1.804 | -1.695 | -1.57 |
| 6.879999999999771 | -1.805 | -1.696 | -1.571 |
| 6.889999999999771 | -1.806 | -1.697 | -1.573 |
| 6.899999999999771 | -1.807 | -1.698 | -1.574 |
| 6.90999999999977 | -1.808 | -1.7 | -1.575 |
| 6.91999999999977 | -1.809 | -1.701 | -1.577 |
| 6.92999999999977 | -1.81 | -1.702 | -1.578 |
| 6.93999999999977 | -1.811 | -1.703 | -1.579 |
| 6.94999999999977 | -1.812 | -1.704 | -1.581 |
| 6.95999999999977 | -1.813 | -1.705 | -1.582 |
| 6.96999999999977 | -1.814 | -1.707 | -1.583 |
| 6.97999999999977 | -1.815 | -1.708 | -1.585 |
| 6.98999999999977 | -1.816 | -1.709 | -1.586 |
| 6.99999999999977 | -1.817 | -1.71 | -1.587 |
| 7.009999999999768 | -1.818 | -1.711 | -1.589 |
| 7.019999999999768 | -1.819 | -1.712 | -1.59 |
| 7.029999999999768 | -1.82 | -1.713 | -1.591 |
| 7.039999999999768 | -1.821 | -1.715 | -1.593 |
| 7.049999999999767 | -1.822 | -1.716 | -1.594 |
| 7.059999999999767 | -1.823 | -1.717 | -1.595 |
| 7.069999999999767 | -1.824 | -1.718 | -1.597 |
| 7.079999999999767 | -1.825 | -1.719 | -1.598 |
| 7.089999999999767 | -1.826 | -1.72 | -1.599 |
| 7.099999999999766 | -1.827 | -1.721 | -1.601 |
| 7.109999999999766 | -1.828 | -1.722 | -1.602 |
| 7.119999999999766 | -1.829 | -1.724 | -1.603 |
| 7.129999999999766 | -1.83 | -1.725 | -1.604 |
| 7.139999999999766 | -1.831 | -1.726 | -1.606 |
| 7.149999999999765 | -1.832 | -1.727 | -1.607 |
| 7.159999999999765 | -1.833 | -1.728 | -1.608 |
| 7.169999999999765 | -1.834 | -1.729 | -1.61 |
| 7.179999999999765 | -1.835 | -1.73 | -1.611 |
| 7.189999999999764 | -1.836 | -1.731 | -1.612 |
| 7.199999999999764 | -1.837 | -1.732 | -1.613 |
| 7.209999999999764 | -1.838 | -1.734 | -1.615 |
| 7.219999999999764 | -1.839 | -1.735 | -1.616 |
| 7.229999999999764 | -1.84 | -1.736 | -1.617 |
| 7.239999999999763 | -1.841 | -1.737 | -1.619 |
| 7.249999999999763 | -1.842 | -1.738 | -1.62 |
| 7.259999999999763 | -1.843 | -1.739 | -1.621 |
| 7.269999999999763 | -1.844 | -1.74 | -1.622 |
| 7.279999999999763 | -1.845 | -1.741 | -1.624 |
| 7.289999999999762 | -1.846 | -1.742 | -1.625 |
| 7.299999999999762 | -1.847 | -1.744 | -1.626 |
| 7.309999999999762 | -1.848 | -1.745 | -1.627 |
| 7.319999999999762 | -1.849 | -1.746 | -1.629 |
| 7.329999999999762 | -1.85 | -1.747 | -1.63 |
| 7.339999999999761 | -1.851 | -1.748 | -1.631 |
| 7.349999999999761 | -1.852 | -1.749 | -1.632 |
| 7.359999999999761 | -1.853 | -1.75 | -1.634 |
| 7.369999999999761 | -1.854 | -1.751 | -1.635 |
| 7.37999999999976 | -1.855 | -1.752 | -1.636 |
| 7.38999999999976 | -1.856 | -1.753 | -1.637 |
| 7.39999999999976 | -1.857 | -1.754 | -1.639 |
| 7.40999999999976 | -1.858 | -1.755 | -1.64 |
| 7.41999999999976 | -1.859 | -1.757 | -1.641 |
| 7.42999999999976 | -1.86 | -1.758 | -1.642 |
| 7.43999999999976 | -1.86 | -1.759 | -1.644 |
| 7.44999999999976 | -1.861 | -1.76 | -1.645 |
| 7.45999999999976 | -1.862 | -1.761 | -1.646 |
| 7.46999999999976 | -1.863 | -1.762 | -1.647 |
| 7.479999999999758 | -1.864 | -1.763 | -1.649 |
| 7.489999999999758 | -1.865 | -1.764 | -1.65 |
| 7.499999999999758 | -1.866 | -1.765 | -1.651 |
| 7.509999999999758 | -1.867 | -1.766 | -1.652 |
| 7.519999999999758 | -1.868 | -1.767 | -1.653 |
| 7.529999999999758 | -1.869 | -1.768 | -1.655 |
| 7.539999999999757 | -1.87 | -1.769 | -1.656 |
| 7.549999999999757 | -1.871 | -1.771 | -1.657 |
| 7.559999999999757 | -1.872 | -1.772 | -1.658 |
| 7.569999999999757 | -1.873 | -1.773 | -1.659 |
| 7.579999999999756 | -1.874 | -1.774 | -1.661 |
| 7.589999999999756 | -1.875 | -1.775 | -1.662 |
| 7.599999999999756 | -1.876 | -1.776 | -1.663 |
| 7.609999999999756 | -1.877 | -1.777 | -1.664 |
| 7.619999999999756 | -1.878 | -1.778 | -1.666 |
| 7.629999999999756 | -1.879 | -1.779 | -1.667 |
| 7.639999999999755 | -1.88 | -1.78 | -1.668 |
| 7.649999999999755 | -1.881 | -1.781 | -1.669 |
| 7.659999999999755 | -1.881 | -1.782 | -1.67 |
| 7.669999999999755 | -1.882 | -1.783 | -1.671 |
| 7.679999999999754 | -1.883 | -1.784 | -1.673 |
| 7.689999999999754 | -1.884 | -1.785 | -1.674 |
| 7.699999999999754 | -1.885 | -1.786 | -1.675 |
| 7.709999999999754 | -1.886 | -1.787 | -1.676 |
| 7.719999999999754 | -1.887 | -1.788 | -1.677 |
| 7.729999999999753 | -1.888 | -1.789 | -1.679 |
| 7.739999999999753 | -1.889 | -1.79 | -1.68 |
| 7.749999999999753 | -1.89 | -1.792 | -1.681 |
| 7.759999999999753 | -1.891 | -1.793 | -1.682 |
| 7.769999999999753 | -1.892 | -1.794 | -1.683 |
| 7.779999999999752 | -1.893 | -1.795 | -1.685 |
| 7.789999999999752 | -1.894 | -1.796 | -1.686 |
| 7.799999999999752 | -1.895 | -1.797 | -1.687 |
| 7.809999999999752 | -1.895 | -1.798 | -1.688 |
| 7.819999999999752 | -1.896 | -1.799 | -1.689 |
| 7.829999999999751 | -1.897 | -1.8 | -1.69 |
| 7.839999999999751 | -1.898 | -1.801 | -1.692 |
| 7.849999999999751 | -1.899 | -1.802 | -1.693 |
| 7.859999999999751 | -1.9 | -1.803 | -1.694 |
| 7.86999999999975 | -1.901 | -1.804 | -1.695 |
| 7.87999999999975 | -1.902 | -1.805 | -1.696 |
| 7.88999999999975 | -1.903 | -1.806 | -1.697 |
| 7.89999999999975 | -1.904 | -1.807 | -1.698 |
| 7.90999999999975 | -1.905 | -1.808 | -1.7 |
| 7.91999999999975 | -1.906 | -1.809 | -1.701 |
| 7.92999999999975 | -1.907 | -1.81 | -1.702 |
| 7.93999999999975 | -1.907 | -1.811 | -1.703 |
| 7.949999999999748 | -1.908 | -1.812 | -1.704 |
| 7.959999999999748 | -1.909 | -1.813 | -1.705 |
| 7.969999999999748 | -1.91 | -1.814 | -1.707 |
| 7.979999999999748 | -1.911 | -1.815 | -1.708 |
| 7.989999999999747 | -1.912 | -1.816 | -1.709 |
| 7.999999999999747 | -1.913 | -1.817 | -1.71 |
| 8.009999999999748 | -1.914 | -1.818 | -1.711 |
| 8.019999999999747 | -1.915 | -1.819 | -1.712 |
| 8.029999999999747 | -1.916 | -1.82 | -1.713 |
| 8.039999999999745 | -1.917 | -1.821 | -1.715 |
| 8.049999999999747 | -1.917 | -1.822 | -1.716 |
| 8.059999999999746 | -1.918 | -1.823 | -1.717 |
| 8.069999999999746 | -1.919 | -1.824 | -1.718 |
| 8.079999999999746 | -1.92 | -1.825 | -1.719 |
| 8.089999999999746 | -1.921 | -1.826 | -1.72 |
| 8.099999999999746 | -1.922 | -1.827 | -1.721 |
| 8.109999999999745 | -1.923 | -1.828 | -1.722 |
| 8.119999999999745 | -1.924 | -1.829 | -1.724 |
| 8.129999999999743 | -1.925 | -1.83 | -1.725 |
| 8.139999999999745 | -1.926 | -1.831 | -1.726 |
| 8.149999999999745 | -1.926 | -1.832 | -1.727 |
| 8.159999999999744 | -1.927 | -1.833 | -1.728 |
| 8.169999999999744 | -1.928 | -1.834 | -1.729 |
| 8.179999999999742 | -1.929 | -1.835 | -1.73 |
| 8.189999999999744 | -1.93 | -1.836 | -1.731 |
| 8.199999999999743 | -1.931 | -1.837 | -1.732 |
| 8.209999999999743 | -1.932 | -1.838 | -1.734 |
| 8.219999999999743 | -1.933 | -1.839 | -1.735 |
| 8.229999999999743 | -1.934 | -1.84 | -1.736 |
| 8.239999999999743 | -1.935 | -1.841 | -1.737 |
| 8.249999999999742 | -1.935 | -1.842 | -1.738 |
| 8.25999999999974 | -1.936 | -1.843 | -1.739 |
| 8.26999999999974 | -1.937 | -1.844 | -1.74 |
| 8.27999999999974 | -1.938 | -1.845 | -1.741 |
| 8.28999999999974 | -1.939 | -1.846 | -1.742 |
| 8.29999999999974 | -1.94 | -1.847 | -1.744 |
| 8.30999999999974 | -1.941 | -1.848 | -1.745 |
| 8.31999999999974 | -1.942 | -1.849 | -1.746 |
| 8.32999999999974 | -1.943 | -1.85 | -1.747 |
| 8.33999999999974 | -1.943 | -1.851 | -1.748 |
| 8.34999999999974 | -1.944 | -1.852 | -1.749 |
| 8.35999999999974 | -1.945 | -1.853 | -1.75 |
| 8.36999999999974 | -1.946 | -1.854 | -1.751 |
| 8.37999999999974 | -1.947 | -1.855 | -1.752 |
| 8.38999999999974 | -1.948 | -1.856 | -1.753 |
| 8.39999999999974 | -1.949 | -1.857 | -1.754 |
| 8.409999999999737 | -1.95 | -1.858 | -1.755 |
| 8.419999999999739 | -1.95 | -1.859 | -1.757 |
| 8.429999999999739 | -1.951 | -1.86 | -1.758 |
| 8.439999999999738 | -1.952 | -1.86 | -1.759 |
| 8.449999999999738 | -1.953 | -1.861 | -1.76 |
| 8.459999999999736 | -1.954 | -1.862 | -1.761 |
| 8.469999999999738 | -1.955 | -1.863 | -1.762 |
| 8.479999999999738 | -1.956 | -1.864 | -1.763 |
| 8.489999999999737 | -1.957 | -1.865 | -1.764 |
| 8.499999999999737 | -1.957 | -1.866 | -1.765 |
| 8.509999999999737 | -1.958 | -1.867 | -1.766 |
| 8.519999999999737 | -1.959 | -1.868 | -1.767 |
| 8.529999999999736 | -1.96 | -1.869 | -1.768 |
| 8.539999999999736 | -1.961 | -1.87 | -1.769 |
| 8.549999999999736 | -1.962 | -1.871 | -1.771 |
| 8.559999999999736 | -1.963 | -1.872 | -1.772 |
| 8.569999999999736 | -1.964 | -1.873 | -1.773 |
| 8.579999999999735 | -1.964 | -1.874 | -1.774 |
| 8.589999999999735 | -1.965 | -1.875 | -1.775 |
| 8.599999999999733 | -1.966 | -1.876 | -1.776 |
| 8.609999999999735 | -1.967 | -1.877 | -1.777 |
| 8.619999999999735 | -1.968 | -1.878 | -1.778 |
| 8.629999999999734 | -1.969 | -1.879 | -1.779 |
| 8.639999999999734 | -1.97 | -1.88 | -1.78 |
| 8.649999999999732 | -1.97 | -1.881 | -1.781 |
| 8.659999999999734 | -1.971 | -1.881 | -1.782 |
| 8.669999999999733 | -1.972 | -1.882 | -1.783 |
| 8.679999999999733 | -1.973 | -1.883 | -1.784 |
| 8.689999999999731 | -1.974 | -1.884 | -1.785 |
| 8.699999999999733 | -1.975 | -1.885 | -1.786 |
| 8.709999999999733 | -1.976 | -1.886 | -1.787 |
| 8.719999999999732 | -1.976 | -1.887 | -1.788 |
| 8.729999999999732 | -1.977 | -1.888 | -1.789 |
| 8.73999999999973 | -1.978 | -1.889 | -1.79 |
| 8.749999999999732 | -1.979 | -1.89 | -1.792 |
| 8.75999999999973 | -1.98 | -1.891 | -1.793 |
| 8.76999999999973 | -1.981 | -1.892 | -1.794 |
| 8.77999999999973 | -1.981 | -1.893 | -1.795 |
| 8.78999999999973 | -1.982 | -1.894 | -1.796 |
| 8.79999999999973 | -1.983 | -1.895 | -1.797 |
| 8.80999999999973 | -1.984 | -1.895 | -1.798 |
| 8.81999999999973 | -1.985 | -1.896 | -1.799 |
| 8.82999999999973 | -1.986 | -1.897 | -1.8 |
| 8.83999999999973 | -1.987 | -1.898 | -1.801 |
| 8.84999999999973 | -1.987 | -1.899 | -1.802 |
| 8.85999999999973 | -1.988 | -1.9 | -1.803 |
| 8.86999999999973 | -1.989 | -1.901 | -1.804 |
| 8.879999999999727 | -1.99 | -1.902 | -1.805 |
| 8.889999999999729 | -1.991 | -1.903 | -1.806 |
| 8.899999999999729 | -1.992 | -1.904 | -1.807 |
| 8.909999999999728 | -1.992 | -1.905 | -1.808 |
| 8.919999999999728 | -1.993 | -1.906 | -1.809 |
| 8.929999999999726 | -1.994 | -1.907 | -1.81 |
| 8.939999999999728 | -1.995 | -1.907 | -1.811 |
| 8.949999999999728 | -1.996 | -1.908 | -1.812 |
| 8.959999999999727 | -1.997 | -1.909 | -1.813 |
| 8.969999999999727 | -1.997 | -1.91 | -1.814 |
| 8.979999999999727 | -1.998 | -1.911 | -1.815 |
| 8.989999999999727 | -1.999 | -1.912 | -1.816 |
| 8.999999999999726 | -2 | -1.913 | -1.817 |
| 9.009999999999726 | -2.001 | -1.914 | -1.818 |
| 9.019999999999726 | -2.002 | -1.915 | -1.819 |
| 9.029999999999726 | -2.002 | -1.916 | -1.82 |
| 9.039999999999726 | -2.003 | -1.917 | -1.821 |
| 9.049999999999725 | -2.004 | -1.917 | -1.822 |
| 9.059999999999725 | -2.005 | -1.918 | -1.823 |
| 9.069999999999723 | -2.006 | -1.919 | -1.824 |
| 9.079999999999725 | -2.007 | -1.92 | -1.825 |
| 9.089999999999725 | -2.007 | -1.921 | -1.826 |
| 9.099999999999724 | -2.008 | -1.922 | -1.827 |
| 9.109999999999724 | -2.009 | -1.923 | -1.828 |
| 9.119999999999724 | -2.01 | -1.924 | -1.829 |
| 9.129999999999724 | -2.011 | -1.925 | -1.83 |
| 9.139999999999723 | -2.012 | -1.926 | -1.831 |
| 9.149999999999723 | -2.012 | -1.926 | -1.832 |
| 9.159999999999723 | -2.013 | -1.927 | -1.833 |
| 9.169999999999723 | -2.014 | -1.928 | -1.834 |
| 9.179999999999723 | -2.015 | -1.929 | -1.835 |
| 9.189999999999722 | -2.016 | -1.93 | -1.836 |
| 9.199999999999722 | -2.017 | -1.931 | -1.837 |
| 9.20999999999972 | -2.017 | -1.932 | -1.838 |
| 9.219999999999722 | -2.018 | -1.933 | -1.839 |
| 9.229999999999722 | -2.019 | -1.934 | -1.84 |
| 9.239999999999721 | -2.02 | -1.935 | -1.841 |
| 9.249999999999721 | -2.021 | -1.935 | -1.842 |
| 9.25999999999972 | -2.021 | -1.936 | -1.843 |
| 9.26999999999972 | -2.022 | -1.937 | -1.844 |
| 9.27999999999972 | -2.023 | -1.938 | -1.845 |
| 9.28999999999972 | -2.024 | -1.939 | -1.846 |
| 9.29999999999972 | -2.025 | -1.94 | -1.847 |
| 9.30999999999972 | -2.026 | -1.941 | -1.848 |
| 9.31999999999972 | -2.026 | -1.942 | -1.849 |
| 9.32999999999972 | -2.027 | -1.943 | -1.85 |
| 9.33999999999972 | -2.028 | -1.943 | -1.851 |
| 9.349999999999717 | -2.029 | -1.944 | -1.852 |
| 9.359999999999719 | -2.03 | -1.945 | -1.853 |
| 9.369999999999719 | -2.03 | -1.946 | -1.854 |
| 9.379999999999718 | -2.031 | -1.947 | -1.855 |
| 9.389999999999718 | -2.032 | -1.948 | -1.856 |
| 9.399999999999716 | -2.033 | -1.949 | -1.857 |
| 9.409999999999718 | -2.034 | -1.95 | -1.858 |
| 9.419999999999717 | -2.034 | -1.95 | -1.859 |
| 9.429999999999717 | -2.035 | -1.951 | -1.86 |
| 9.439999999999717 | -2.036 | -1.952 | -1.86 |
| 9.449999999999717 | -2.037 | -1.953 | -1.861 |
| 9.459999999999717 | -2.038 | -1.954 | -1.862 |
| 9.469999999999716 | -2.038 | -1.955 | -1.863 |
| 9.479999999999716 | -2.039 | -1.956 | -1.864 |
| 9.489999999999714 | -2.04 | -1.957 | -1.865 |
| 9.499999999999716 | -2.041 | -1.957 | -1.866 |
| 9.509999999999716 | -2.042 | -1.958 | -1.867 |
| 9.519999999999715 | -2.042 | -1.959 | -1.868 |
| 9.529999999999715 | -2.043 | -1.96 | -1.869 |
| 9.539999999999713 | -2.044 | -1.961 | -1.87 |
| 9.549999999999715 | -2.045 | -1.962 | -1.871 |
| 9.559999999999715 | -2.046 | -1.963 | -1.872 |
| 9.569999999999714 | -2.046 | -1.964 | -1.873 |
| 9.579999999999714 | -2.047 | -1.964 | -1.874 |
| 9.589999999999714 | -2.048 | -1.965 | -1.875 |
| 9.599999999999714 | -2.049 | -1.966 | -1.876 |
| 9.609999999999713 | -2.05 | -1.967 | -1.877 |
| 9.619999999999713 | -2.05 | -1.968 | -1.878 |
| 9.629999999999711 | -2.051 | -1.969 | -1.879 |
| 9.639999999999713 | -2.052 | -1.97 | -1.88 |
| 9.649999999999713 | -2.053 | -1.97 | -1.881 |
| 9.65999999999971 | -2.054 | -1.971 | -1.881 |
| 9.66999999999971 | -2.054 | -1.972 | -1.882 |
| 9.67999999999971 | -2.055 | -1.973 | -1.883 |
| 9.68999999999971 | -2.056 | -1.974 | -1.884 |
| 9.69999999999971 | -2.057 | -1.975 | -1.885 |
| 9.70999999999971 | -2.057 | -1.976 | -1.886 |
| 9.71999999999971 | -2.058 | -1.976 | -1.887 |
| 9.72999999999971 | -2.059 | -1.977 | -1.888 |
| 9.73999999999971 | -2.06 | -1.978 | -1.889 |
| 9.74999999999971 | -2.061 | -1.979 | -1.89 |
| 9.75999999999971 | -2.061 | -1.98 | -1.891 |
| 9.76999999999971 | -2.062 | -1.981 | -1.892 |
| 9.77999999999971 | -2.063 | -1.981 | -1.893 |
| 9.78999999999971 | -2.064 | -1.982 | -1.894 |
| 9.79999999999971 | -2.065 | -1.983 | -1.895 |
| 9.80999999999971 | -2.065 | -1.984 | -1.895 |
| 9.819999999999707 | -2.066 | -1.985 | -1.896 |
| 9.829999999999709 | -2.067 | -1.986 | -1.897 |
| 9.839999999999709 | -2.068 | -1.987 | -1.898 |
| 9.849999999999708 | -2.068 | -1.987 | -1.899 |
| 9.859999999999708 | -2.069 | -1.988 | -1.9 |
| 9.869999999999706 | -2.07 | -1.989 | -1.901 |
| 9.879999999999708 | -2.071 | -1.99 | -1.902 |
| 9.889999999999707 | -2.072 | -1.991 | -1.903 |
| 9.899999999999707 | -2.072 | -1.992 | -1.904 |
| 9.909999999999707 | -2.073 | -1.992 | -1.905 |
| 9.919999999999707 | -2.074 | -1.993 | -1.906 |
| 9.929999999999707 | -2.075 | -1.994 | -1.907 |
| 9.939999999999706 | -2.075 | -1.995 | -1.907 |
| 9.949999999999706 | -2.076 | -1.996 | -1.908 |
| 9.959999999999704 | -2.077 | -1.997 | -1.909 |
| 9.969999999999706 | -2.078 | -1.997 | -1.91 |
| 9.979999999999706 | -2.079 | -1.998 | -1.911 |
| 9.989999999999705 | -2.079 | -1.999 | -1.912 |
| 9.999999999999705 | -2.08 | -2 | -1.913 |
| 10.0099999999997 | -2.081 | -2.001 | -1.914 |
| 10.0199999999997 | -2.082 | -2.002 | -1.915 |
| 10.0299999999997 | -2.082 | -2.002 | -1.916 |
| 10.0399999999997 | -2.083 | -2.003 | -1.917 |
| 10.0499999999997 | -2.084 | -2.004 | -1.917 |
| 10.0599999999997 | -2.085 | -2.005 | -1.918 |
| 10.0699999999997 | -2.085 | -2.006 | -1.919 |
| 10.0799999999997 | -2.086 | -2.007 | -1.92 |
| 10.0899999999997 | -2.087 | -2.007 | -1.921 |
| 10.0999999999997 | -2.088 | -2.008 | -1.922 |
| 10.1099999999997 | -2.089 | -2.009 | -1.923 |
| 10.1199999999997 | -2.089 | -2.01 | -1.924 |
| 10.1299999999997 | -2.09 | -2.011 | -1.925 |
| 10.1399999999997 | -2.091 | -2.012 | -1.926 |
| 10.1499999999997 | -2.092 | -2.012 | -1.926 |
| 10.1599999999997 | -2.092 | -2.013 | -1.927 |
| 10.1699999999997 | -2.093 | -2.014 | -1.928 |
| 10.1799999999997 | -2.094 | -2.015 | -1.929 |
| 10.1899999999997 | -2.095 | -2.016 | -1.93 |
| 10.1999999999997 | -2.095 | -2.017 | -1.931 |
| 10.2099999999997 | -2.096 | -2.017 | -1.932 |
| 10.2199999999997 | -2.097 | -2.018 | -1.933 |
| 10.2299999999997 | -2.098 | -2.019 | -1.934 |
| 10.2399999999997 | -2.098 | -2.02 | -1.935 |
| 10.2499999999997 | -2.099 | -2.021 | -1.935 |
| 10.2599999999997 | -2.1 | -2.021 | -1.936 |
| 10.2699999999997 | -2.101 | -2.022 | -1.937 |
| 10.2799999999997 | -2.101 | -2.023 | -1.938 |
| 10.2899999999997 | -2.102 | -2.024 | -1.939 |
| 10.2999999999997 | -2.103 | -2.025 | -1.94 |
| 10.3099999999997 | -2.104 | -2.026 | -1.941 |
| 10.3199999999997 | -2.104 | -2.026 | -1.942 |
| 10.3299999999997 | -2.105 | -2.027 | -1.943 |
| 10.3399999999997 | -2.106 | -2.028 | -1.943 |
| 10.3499999999997 | -2.107 | -2.029 | -1.944 |
| 10.3599999999997 | -2.107 | -2.03 | -1.945 |
| 10.3699999999997 | -2.108 | -2.03 | -1.946 |
| 10.3799999999997 | -2.109 | -2.031 | -1.947 |
| 10.3899999999997 | -2.11 | -2.032 | -1.948 |
| 10.3999999999997 | -2.11 | -2.033 | -1.949 |
| 10.4099999999997 | -2.111 | -2.034 | -1.95 |
| 10.4199999999997 | -2.112 | -2.034 | -1.95 |
| 10.4299999999997 | -2.113 | -2.035 | -1.951 |
| 10.4399999999997 | -2.113 | -2.036 | -1.952 |
| 10.4499999999997 | -2.114 | -2.037 | -1.953 |
| 10.4599999999997 | -2.115 | -2.038 | -1.954 |
| 10.4699999999997 | -2.116 | -2.038 | -1.955 |
| 10.47999999999969 | -2.116 | -2.039 | -1.956 |
| 10.48999999999969 | -2.117 | -2.04 | -1.957 |
| 10.49999999999969 | -2.118 | -2.041 | -1.957 |
| 10.50999999999969 | -2.119 | -2.042 | -1.958 |
| 10.51999999999969 | -2.119 | -2.042 | -1.959 |
| 10.52999999999969 | -2.12 | -2.043 | -1.96 |
| 10.53999999999969 | -2.121 | -2.044 | -1.961 |
| 10.54999999999969 | -2.122 | -2.045 | -1.962 |
| 10.5599999999997 | -2.122 | -2.046 | -1.963 |
| 10.5699999999997 | -2.123 | -2.046 | -1.964 |
| 10.5799999999997 | -2.124 | -2.047 | -1.964 |
| 10.5899999999997 | -2.125 | -2.048 | -1.965 |
| 10.5999999999997 | -2.125 | -2.049 | -1.966 |
| 10.6099999999997 | -2.126 | -2.05 | -1.967 |
| 10.6199999999997 | -2.127 | -2.05 | -1.968 |
| 10.6299999999997 | -2.128 | -2.051 | -1.969 |
| 10.6399999999997 | -2.128 | -2.052 | -1.97 |
| 10.6499999999997 | -2.129 | -2.053 | -1.97 |
| 10.6599999999997 | -2.13 | -2.054 | -1.971 |
| 10.6699999999997 | -2.13 | -2.054 | -1.972 |
| 10.6799999999997 | -2.131 | -2.055 | -1.973 |
| 10.6899999999997 | -2.132 | -2.056 | -1.974 |
| 10.6999999999997 | -2.133 | -2.057 | -1.975 |
| 10.70999999999969 | -2.133 | -2.057 | -1.976 |
| 10.71999999999969 | -2.134 | -2.058 | -1.976 |
| 10.72999999999969 | -2.135 | -2.059 | -1.977 |
| 10.73999999999969 | -2.136 | -2.06 | -1.978 |
| 10.74999999999969 | -2.136 | -2.061 | -1.979 |
| 10.75999999999969 | -2.137 | -2.061 | -1.98 |
| 10.76999999999969 | -2.138 | -2.062 | -1.981 |
| 10.77999999999969 | -2.139 | -2.063 | -1.981 |
| 10.78999999999969 | -2.139 | -2.064 | -1.982 |
| 10.79999999999969 | -2.14 | -2.065 | -1.983 |
| 10.80999999999969 | -2.141 | -2.065 | -1.984 |
| 10.81999999999969 | -2.141 | -2.066 | -1.985 |
| 10.82999999999969 | -2.142 | -2.067 | -1.986 |
| 10.83999999999969 | -2.143 | -2.068 | -1.987 |
| 10.84999999999969 | -2.144 | -2.068 | -1.987 |
| 10.85999999999969 | -2.144 | -2.069 | -1.988 |
| 10.86999999999969 | -2.145 | -2.07 | -1.989 |
| 10.87999999999969 | -2.146 | -2.071 | -1.99 |
| 10.88999999999969 | -2.147 | -2.072 | -1.991 |
| 10.89999999999969 | -2.147 | -2.072 | -1.992 |
| 10.90999999999969 | -2.148 | -2.073 | -1.992 |
| 10.91999999999969 | -2.149 | -2.074 | -1.993 |
| 10.92999999999969 | -2.149 | -2.075 | -1.994 |
| 10.93999999999969 | -2.15 | -2.075 | -1.995 |
| 10.94999999999968 | -2.151 | -2.076 | -1.996 |
| 10.95999999999968 | -2.152 | -2.077 | -1.997 |
| 10.96999999999968 | -2.152 | -2.078 | -1.997 |
| 10.97999999999968 | -2.153 | -2.079 | -1.998 |
| 10.98999999999968 | -2.154 | -2.079 | -1.999 |
| 10.99999999999968 | -2.154 | -2.08 | -2 |
| 11.00999999999968 | -2.155 | -2.081 | -2.001 |
| 11.01999999999968 | -2.156 | -2.082 | -2.002 |
| 11.02999999999968 | -2.157 | -2.082 | -2.002 |
| 11.03999999999968 | -2.157 | -2.083 | -2.003 |
| 11.04999999999968 | -2.158 | -2.084 | -2.004 |
| 11.05999999999968 | -2.159 | -2.085 | -2.005 |
| 11.06999999999968 | -2.159 | -2.085 | -2.006 |
| 11.07999999999968 | -2.16 | -2.086 | -2.007 |
| 11.08999999999968 | -2.161 | -2.087 | -2.007 |
| 11.09999999999968 | -2.162 | -2.088 | -2.008 |
| 11.10999999999968 | -2.162 | -2.089 | -2.009 |
| 11.11999999999968 | -2.163 | -2.089 | -2.01 |
| 11.12999999999968 | -2.164 | -2.09 | -2.011 |
| 11.13999999999968 | -2.164 | -2.091 | -2.012 |
| 11.14999999999968 | -2.165 | -2.092 | -2.012 |
| 11.15999999999968 | -2.166 | -2.092 | -2.013 |
| 11.16999999999968 | -2.167 | -2.093 | -2.014 |
| 11.17999999999968 | -2.167 | -2.094 | -2.015 |
| 11.18999999999968 | -2.168 | -2.095 | -2.016 |
| 11.19999999999968 | -2.169 | -2.095 | -2.017 |
| 11.20999999999968 | -2.169 | -2.096 | -2.017 |
| 11.21999999999968 | -2.17 | -2.097 | -2.018 |
| 11.22999999999968 | -2.171 | -2.098 | -2.019 |
| 11.23999999999968 | -2.172 | -2.098 | -2.02 |
| 11.24999999999968 | -2.172 | -2.099 | -2.021 |
| 11.25999999999968 | -2.173 | -2.1 | -2.021 |
| 11.26999999999968 | -2.174 | -2.101 | -2.022 |
| 11.27999999999968 | -2.174 | -2.101 | -2.023 |
| 11.28999999999968 | -2.175 | -2.102 | -2.024 |
| 11.29999999999968 | -2.176 | -2.103 | -2.025 |
| 11.30999999999968 | -2.176 | -2.104 | -2.026 |
| 11.31999999999968 | -2.177 | -2.104 | -2.026 |
| 11.32999999999968 | -2.178 | -2.105 | -2.027 |
| 11.33999999999968 | -2.179 | -2.106 | -2.028 |
| 11.34999999999968 | -2.179 | -2.107 | -2.029 |
| 11.35999999999968 | -2.18 | -2.107 | -2.03 |
| 11.36999999999968 | -2.181 | -2.108 | -2.03 |
| 11.37999999999968 | -2.181 | -2.109 | -2.031 |
| 11.38999999999968 | -2.182 | -2.11 | -2.032 |
| 11.39999999999968 | -2.183 | -2.11 | -2.033 |
| 11.40999999999968 | -2.183 | -2.111 | -2.034 |
| 11.41999999999967 | -2.184 | -2.112 | -2.034 |
| 11.42999999999967 | -2.185 | -2.113 | -2.035 |
| 11.43999999999967 | -2.186 | -2.113 | -2.036 |
| 11.44999999999967 | -2.186 | -2.114 | -2.037 |
| 11.45999999999967 | -2.187 | -2.115 | -2.038 |
| 11.46999999999967 | -2.188 | -2.116 | -2.038 |
| 11.47999999999967 | -2.188 | -2.116 | -2.039 |
| 11.48999999999967 | -2.189 | -2.117 | -2.04 |
| 11.49999999999967 | -2.19 | -2.118 | -2.041 |
| 11.50999999999967 | -2.19 | -2.119 | -2.042 |
| 11.51999999999967 | -2.191 | -2.119 | -2.042 |
| 11.52999999999967 | -2.192 | -2.12 | -2.043 |
| 11.53999999999967 | -2.193 | -2.121 | -2.044 |
| 11.54999999999967 | -2.193 | -2.122 | -2.045 |
| 11.55999999999967 | -2.194 | -2.122 | -2.046 |
| 11.56999999999967 | -2.195 | -2.123 | -2.046 |
| 11.57999999999967 | -2.195 | -2.124 | -2.047 |
| 11.58999999999967 | -2.196 | -2.125 | -2.048 |
| 11.59999999999967 | -2.197 | -2.125 | -2.049 |
| 11.60999999999967 | -2.197 | -2.126 | -2.05 |
| 11.61999999999967 | -2.198 | -2.127 | -2.05 |
| 11.62999999999967 | -2.199 | -2.128 | -2.051 |
| 11.63999999999967 | -2.199 | -2.128 | -2.052 |
| 11.64999999999967 | -2.2 | -2.129 | -2.053 |
| 11.65999999999967 | -2.201 | -2.13 | -2.054 |
| 11.66999999999967 | -2.202 | -2.13 | -2.054 |
| 11.67999999999967 | -2.202 | -2.131 | -2.055 |
| 11.68999999999967 | -2.203 | -2.132 | -2.056 |
| 11.69999999999967 | -2.204 | -2.133 | -2.057 |
| 11.70999999999967 | -2.204 | -2.133 | -2.057 |
| 11.71999999999967 | -2.205 | -2.134 | -2.058 |
| 11.72999999999967 | -2.206 | -2.135 | -2.059 |
| 11.73999999999967 | -2.206 | -2.136 | -2.06 |
| 11.74999999999967 | -2.207 | -2.136 | -2.061 |
| 11.75999999999967 | -2.208 | -2.137 | -2.061 |
| 11.76999999999967 | -2.208 | -2.138 | -2.062 |
| 11.77999999999967 | -2.209 | -2.139 | -2.063 |
| 11.78999999999967 | -2.21 | -2.139 | -2.064 |
| 11.79999999999967 | -2.21 | -2.14 | -2.065 |
| 11.80999999999967 | -2.211 | -2.141 | -2.065 |
| 11.81999999999967 | -2.212 | -2.141 | -2.066 |
| 11.82999999999967 | -2.212 | -2.142 | -2.067 |
| 11.83999999999967 | -2.213 | -2.143 | -2.068 |
| 11.84999999999967 | -2.214 | -2.144 | -2.068 |
| 11.85999999999967 | -2.215 | -2.144 | -2.069 |
| 11.86999999999967 | -2.215 | -2.145 | -2.07 |
| 11.87999999999966 | -2.216 | -2.146 | -2.071 |
| 11.88999999999966 | -2.217 | -2.147 | -2.072 |
| 11.89999999999966 | -2.217 | -2.147 | -2.072 |
| 11.90999999999966 | -2.218 | -2.148 | -2.073 |
| 11.91999999999966 | -2.219 | -2.149 | -2.074 |
| 11.92999999999966 | -2.219 | -2.149 | -2.075 |
| 11.93999999999966 | -2.22 | -2.15 | -2.075 |
| 11.94999999999966 | -2.221 | -2.151 | -2.076 |
| 11.95999999999966 | -2.221 | -2.152 | -2.077 |
| 11.96999999999966 | -2.222 | -2.152 | -2.078 |
| 11.97999999999966 | -2.223 | -2.153 | -2.079 |
| 11.98999999999966 | -2.223 | -2.154 | -2.079 |
| 11.99999999999966 | -2.224 | -2.154 | -2.08 |